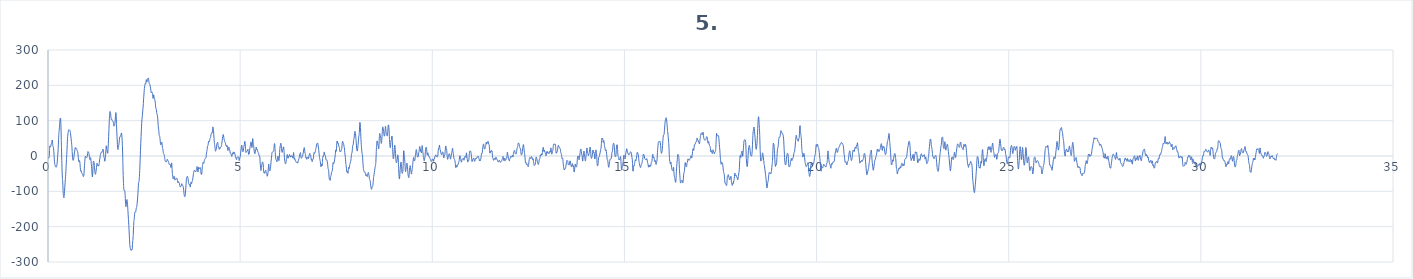
| Category | 5. kanál |
|---|---|
| 0.0 | -8.5 |
| 0.0078125 | -5.8 |
| 0.015625 | -3.4 |
| 0.0234375 | -5.3 |
| 0.03125 | -0.5 |
| 0.0390625 | 15.7 |
| 0.046875 | 28.1 |
| 0.0546875 | 28.7 |
| 0.0625 | 26.1 |
| 0.0703125 | 26.9 |
| 0.078125 | 31.5 |
| 0.0859375 | 34.8 |
| 0.09375 | 35.1 |
| 0.1015625 | 39.7 |
| 0.109375 | 45.2 |
| 0.1171875 | 39.4 |
| 0.125 | 29.9 |
| 0.1328125 | 26.7 |
| 0.140625 | 23.4 |
| 0.1484375 | 16.4 |
| 0.15625 | 5.7 |
| 0.1640625 | -9 |
| 0.171875 | -19.6 |
| 0.1796875 | -23.7 |
| 0.1875 | -27.8 |
| 0.1953125 | -30.5 |
| 0.203125 | -30.4 |
| 0.2109375 | -31.5 |
| 0.21875 | -31.2 |
| 0.2265625 | -27.9 |
| 0.234375 | -23.1 |
| 0.2421875 | -14.2 |
| 0.25 | -2.1 |
| 0.2578125 | 8.3 |
| 0.265625 | 21.5 |
| 0.2734375 | 42.2 |
| 0.28125 | 61.2 |
| 0.2890625 | 71.3 |
| 0.296875 | 79.9 |
| 0.3046875 | 92.3 |
| 0.3125 | 102.2 |
| 0.3203125 | 107.2 |
| 0.328125 | 106.1 |
| 0.3359375 | 88 |
| 0.34375 | 53.8 |
| 0.3515625 | 19.7 |
| 0.359375 | -13.3 |
| 0.3671875 | -45.1 |
| 0.375 | -62.5 |
| 0.3828125 | -73.9 |
| 0.390625 | -93.4 |
| 0.3984375 | -109 |
| 0.40625 | -115.3 |
| 0.4140625 | -118.2 |
| 0.421875 | -112.4 |
| 0.4296875 | -100 |
| 0.4375 | -87.9 |
| 0.4453125 | -74.9 |
| 0.453125 | -63.1 |
| 0.4609375 | -52 |
| 0.46875 | -35.5 |
| 0.4765625 | -17.7 |
| 0.484375 | -3.5 |
| 0.4921875 | 12.3 |
| 0.5 | 32.6 |
| 0.5078125 | 50 |
| 0.515625 | 59.3 |
| 0.5234375 | 65.8 |
| 0.53125 | 71.6 |
| 0.5390625 | 74.2 |
| 0.546875 | 74.5 |
| 0.5546875 | 73.3 |
| 0.5625 | 72.4 |
| 0.5703125 | 72.9 |
| 0.578125 | 69.6 |
| 0.5859375 | 62.8 |
| 0.59375 | 56.4 |
| 0.6015625 | 48.7 |
| 0.609375 | 40.9 |
| 0.6171875 | 33 |
| 0.625 | 20.3 |
| 0.6328125 | 5.9 |
| 0.640625 | -5 |
| 0.6484375 | -11.2 |
| 0.65625 | -12.4 |
| 0.6640625 | -10.1 |
| 0.671875 | -5 |
| 0.6796875 | 2.7 |
| 0.6875 | 8.5 |
| 0.6953125 | 13.8 |
| 0.703125 | 21.3 |
| 0.7109375 | 23.9 |
| 0.71875 | 21.2 |
| 0.7265625 | 21.3 |
| 0.734375 | 22.3 |
| 0.7421875 | 20.7 |
| 0.75 | 18.5 |
| 0.7578125 | 15.5 |
| 0.765625 | 13.5 |
| 0.7734375 | 10.9 |
| 0.78125 | 3.5 |
| 0.7890625 | -4.4 |
| 0.796875 | -11.1 |
| 0.8046875 | -16.4 |
| 0.8125 | -15.2 |
| 0.8203125 | -13 |
| 0.828125 | -17.1 |
| 0.8359375 | -26.1 |
| 0.84375 | -37.5 |
| 0.8515625 | -43 |
| 0.859375 | -41.1 |
| 0.8671875 | -43.5 |
| 0.875 | -48.4 |
| 0.8828125 | -49.3 |
| 0.890625 | -49.8 |
| 0.8984375 | -50.3 |
| 0.90625 | -52.7 |
| 0.9140625 | -57.2 |
| 0.921875 | -58.2 |
| 0.9296875 | -56.7 |
| 0.9375 | -49.9 |
| 0.9453125 | -34.7 |
| 0.953125 | -21.2 |
| 0.9609375 | -10.9 |
| 0.96875 | -1.9 |
| 0.9765625 | -0.4 |
| 0.984375 | -2.4 |
| 0.9921875 | -2.8 |
| 1.0 | -4.4 |
| 1.0078125 | -4.7 |
| 1.015625 | -3.5 |
| 1.0234375 | -1 |
| 1.03125 | 6.7 |
| 1.0390625 | 12.6 |
| 1.046875 | 10.4 |
| 1.0546875 | 9.2 |
| 1.0625 | 9.4 |
| 1.0703125 | 3.8 |
| 1.078125 | -4 |
| 1.0859375 | -9.3 |
| 1.09375 | -10 |
| 1.1015625 | -5.8 |
| 1.109375 | -4.7 |
| 1.1171875 | -11.5 |
| 1.125 | -20.3 |
| 1.1328125 | -29.6 |
| 1.140625 | -41.8 |
| 1.1484375 | -53.7 |
| 1.15625 | -59.5 |
| 1.1640625 | -51.7 |
| 1.171875 | -30.6 |
| 1.1796875 | -15.1 |
| 1.1875 | -14.6 |
| 1.1953125 | -17.3 |
| 1.203125 | -21.6 |
| 1.2109375 | -33.2 |
| 1.21875 | -44 |
| 1.2265625 | -49.3 |
| 1.234375 | -51.9 |
| 1.2421875 | -49.2 |
| 1.25 | -42.8 |
| 1.2578125 | -36.8 |
| 1.265625 | -28 |
| 1.2734375 | -20.7 |
| 1.28125 | -22.9 |
| 1.2890625 | -26.4 |
| 1.296875 | -25.1 |
| 1.3046875 | -26 |
| 1.3125 | -28.7 |
| 1.3203125 | -27.8 |
| 1.328125 | -24.2 |
| 1.3359375 | -18.3 |
| 1.34375 | -11.1 |
| 1.3515625 | -5.6 |
| 1.359375 | 0.8 |
| 1.3671875 | 7 |
| 1.375 | 8.1 |
| 1.3828125 | 7.7 |
| 1.390625 | 10.5 |
| 1.3984375 | 11.8 |
| 1.40625 | 10.7 |
| 1.4140625 | 13.3 |
| 1.421875 | 18.1 |
| 1.4296875 | 19.6 |
| 1.4375 | 17.3 |
| 1.4453125 | 9.3 |
| 1.453125 | -0.8 |
| 1.4609375 | -4.4 |
| 1.46875 | -7.6 |
| 1.4765625 | -14.4 |
| 1.484375 | -13.1 |
| 1.4921875 | -4.6 |
| 1.5 | 4.3 |
| 1.5078125 | 18.5 |
| 1.515625 | 29 |
| 1.5234375 | 25.5 |
| 1.53125 | 19.3 |
| 1.5390625 | 15.1 |
| 1.546875 | 8.5 |
| 1.5546875 | 7.9 |
| 1.5625 | 18.7 |
| 1.5703125 | 35.3 |
| 1.578125 | 54.6 |
| 1.5859375 | 75.2 |
| 1.59375 | 96.2 |
| 1.6015625 | 115.2 |
| 1.609375 | 125.1 |
| 1.6171875 | 125.5 |
| 1.625 | 123.1 |
| 1.6328125 | 116.5 |
| 1.640625 | 106.6 |
| 1.6484375 | 103.2 |
| 1.65625 | 104.5 |
| 1.6640625 | 102.4 |
| 1.671875 | 100.5 |
| 1.6796875 | 99.6 |
| 1.6875 | 97.3 |
| 1.6953125 | 97.4 |
| 1.703125 | 95.5 |
| 1.7109375 | 87.9 |
| 1.71875 | 84.4 |
| 1.7265625 | 86.5 |
| 1.734375 | 88.6 |
| 1.7421875 | 94.2 |
| 1.75 | 104.1 |
| 1.7578125 | 115.3 |
| 1.765625 | 123 |
| 1.7734375 | 115.5 |
| 1.78125 | 92.6 |
| 1.7890625 | 70.5 |
| 1.796875 | 54.5 |
| 1.8046875 | 37 |
| 1.8125 | 21.3 |
| 1.8203125 | 18.2 |
| 1.828125 | 24.4 |
| 1.8359375 | 28.7 |
| 1.84375 | 31.5 |
| 1.8515625 | 38.7 |
| 1.859375 | 47.7 |
| 1.8671875 | 53.7 |
| 1.875 | 55.3 |
| 1.8828125 | 55.3 |
| 1.890625 | 57.1 |
| 1.8984375 | 60.3 |
| 1.90625 | 64 |
| 1.9140625 | 64.8 |
| 1.921875 | 57.3 |
| 1.9296875 | 44.3 |
| 1.9375 | 25.8 |
| 1.9453125 | -5.2 |
| 1.953125 | -40.5 |
| 1.9609375 | -67.6 |
| 1.96875 | -86.8 |
| 1.9765625 | -96.7 |
| 1.984375 | -97.5 |
| 1.9921875 | -97.3 |
| 2.0 | -100.6 |
| 2.0078125 | -111.8 |
| 2.015625 | -130.2 |
| 2.0234375 | -143 |
| 2.03125 | -143.6 |
| 2.0390625 | -136.2 |
| 2.046875 | -127 |
| 2.0546875 | -123.2 |
| 2.0625 | -128.1 |
| 2.0703125 | -137.6 |
| 2.078125 | -150.8 |
| 2.0859375 | -166.5 |
| 2.09375 | -180.2 |
| 2.1015625 | -193.2 |
| 2.109375 | -209.1 |
| 2.1171875 | -226.8 |
| 2.125 | -243.4 |
| 2.1328125 | -254.8 |
| 2.140625 | -260.1 |
| 2.1484375 | -263.1 |
| 2.15625 | -265.9 |
| 2.1640625 | -267.2 |
| 2.171875 | -265.4 |
| 2.1796875 | -264.4 |
| 2.1875 | -265.5 |
| 2.1953125 | -257.8 |
| 2.203125 | -243 |
| 2.2109375 | -235.1 |
| 2.21875 | -222.8 |
| 2.2265625 | -199.4 |
| 2.234375 | -185.1 |
| 2.2421875 | -179.8 |
| 2.25 | -170 |
| 2.2578125 | -161.4 |
| 2.265625 | -158.3 |
| 2.2734375 | -158 |
| 2.28125 | -158.5 |
| 2.2890625 | -153.6 |
| 2.296875 | -147.1 |
| 2.3046875 | -145.3 |
| 2.3125 | -142 |
| 2.3203125 | -134 |
| 2.328125 | -124.5 |
| 2.3359375 | -113.1 |
| 2.34375 | -98.8 |
| 2.3515625 | -84.1 |
| 2.359375 | -75.5 |
| 2.3671875 | -72.5 |
| 2.375 | -64.4 |
| 2.3828125 | -49.5 |
| 2.390625 | -31.1 |
| 2.3984375 | -8.6 |
| 2.40625 | 15 |
| 2.4140625 | 35.6 |
| 2.421875 | 54.7 |
| 2.4296875 | 74.5 |
| 2.4375 | 92.7 |
| 2.4453125 | 103.7 |
| 2.453125 | 111.2 |
| 2.4609375 | 121.7 |
| 2.46875 | 131.3 |
| 2.4765625 | 141.5 |
| 2.484375 | 155.8 |
| 2.4921875 | 167.8 |
| 2.5 | 179 |
| 2.5078125 | 191.3 |
| 2.515625 | 197.9 |
| 2.5234375 | 201.9 |
| 2.53125 | 205.2 |
| 2.5390625 | 203.5 |
| 2.546875 | 205.4 |
| 2.5546875 | 214 |
| 2.5625 | 215.8 |
| 2.5703125 | 210.3 |
| 2.578125 | 210.2 |
| 2.5859375 | 215.7 |
| 2.59375 | 218.5 |
| 2.6015625 | 218.9 |
| 2.609375 | 220.9 |
| 2.6171875 | 219.2 |
| 2.625 | 211.2 |
| 2.6328125 | 205.6 |
| 2.640625 | 204.9 |
| 2.6484375 | 203 |
| 2.65625 | 199.1 |
| 2.6640625 | 195.2 |
| 2.671875 | 190 |
| 2.6796875 | 183.2 |
| 2.6875 | 178.7 |
| 2.6953125 | 179.5 |
| 2.703125 | 181.6 |
| 2.7109375 | 180.1 |
| 2.71875 | 176.8 |
| 2.7265625 | 169.8 |
| 2.734375 | 162.8 |
| 2.7421875 | 167.2 |
| 2.75 | 173.3 |
| 2.7578125 | 168.9 |
| 2.765625 | 164.4 |
| 2.7734375 | 162.2 |
| 2.78125 | 157.5 |
| 2.7890625 | 153.2 |
| 2.796875 | 144.7 |
| 2.8046875 | 135.6 |
| 2.8125 | 134.5 |
| 2.8203125 | 131.2 |
| 2.828125 | 123.3 |
| 2.8359375 | 118.5 |
| 2.84375 | 115.1 |
| 2.8515625 | 110.4 |
| 2.859375 | 100.2 |
| 2.8671875 | 86.5 |
| 2.875 | 79.2 |
| 2.8828125 | 72.1 |
| 2.890625 | 61.4 |
| 2.8984375 | 56.9 |
| 2.90625 | 55.7 |
| 2.9140625 | 49.6 |
| 2.921875 | 40.2 |
| 2.9296875 | 32.9 |
| 2.9375 | 31.7 |
| 2.9453125 | 33 |
| 2.953125 | 35.9 |
| 2.9609375 | 39.3 |
| 2.96875 | 34 |
| 2.9765625 | 24.8 |
| 2.984375 | 21.4 |
| 2.9921875 | 16.8 |
| 3.0 | 9.9 |
| 3.0078125 | 6.9 |
| 3.015625 | 5.7 |
| 3.0234375 | 3.4 |
| 3.03125 | -1.4 |
| 3.0390625 | -7.7 |
| 3.046875 | -11.8 |
| 3.0546875 | -14.8 |
| 3.0625 | -16.8 |
| 3.0703125 | -16 |
| 3.078125 | -16 |
| 3.0859375 | -16.2 |
| 3.09375 | -13.4 |
| 3.1015625 | -9.9 |
| 3.109375 | -9.3 |
| 3.1171875 | -12 |
| 3.125 | -14.3 |
| 3.1328125 | -15 |
| 3.140625 | -18.2 |
| 3.1484375 | -22.7 |
| 3.15625 | -24.2 |
| 3.1640625 | -23.3 |
| 3.171875 | -22.7 |
| 3.1796875 | -23.4 |
| 3.1875 | -26.5 |
| 3.1953125 | -32.1 |
| 3.203125 | -32.7 |
| 3.2109375 | -23.4 |
| 3.21875 | -19.5 |
| 3.2265625 | -31.9 |
| 3.234375 | -45.5 |
| 3.2421875 | -53.4 |
| 3.25 | -61.3 |
| 3.2578125 | -65.1 |
| 3.265625 | -63.5 |
| 3.2734375 | -60.4 |
| 3.28125 | -57.1 |
| 3.2890625 | -59.8 |
| 3.296875 | -66.7 |
| 3.3046875 | -68.4 |
| 3.3125 | -66.2 |
| 3.3203125 | -64.2 |
| 3.328125 | -63.1 |
| 3.3359375 | -63.8 |
| 3.34375 | -63.1 |
| 3.3515625 | -62.3 |
| 3.359375 | -64.8 |
| 3.3671875 | -69.4 |
| 3.375 | -74.7 |
| 3.3828125 | -75.8 |
| 3.390625 | -72.5 |
| 3.3984375 | -72.7 |
| 3.40625 | -74.9 |
| 3.4140625 | -75.8 |
| 3.421875 | -79.3 |
| 3.4296875 | -83.4 |
| 3.4375 | -86.6 |
| 3.4453125 | -87.7 |
| 3.453125 | -85.4 |
| 3.4609375 | -84.9 |
| 3.46875 | -84.2 |
| 3.4765625 | -79.1 |
| 3.484375 | -78.5 |
| 3.4921875 | -82.1 |
| 3.5 | -82.5 |
| 3.5078125 | -83.2 |
| 3.515625 | -86.1 |
| 3.5234375 | -90.3 |
| 3.53125 | -97.8 |
| 3.5390625 | -106.1 |
| 3.546875 | -111.6 |
| 3.5546875 | -114.5 |
| 3.5625 | -115.1 |
| 3.5703125 | -111.2 |
| 3.578125 | -101.9 |
| 3.5859375 | -90.2 |
| 3.59375 | -77.2 |
| 3.6015625 | -65.9 |
| 3.609375 | -61.2 |
| 3.6171875 | -59.3 |
| 3.625 | -57.3 |
| 3.6328125 | -58.6 |
| 3.640625 | -61.8 |
| 3.6484375 | -67.1 |
| 3.65625 | -74.9 |
| 3.6640625 | -79.5 |
| 3.671875 | -80.9 |
| 3.6796875 | -80.9 |
| 3.6875 | -80.1 |
| 3.6953125 | -84.4 |
| 3.703125 | -87.9 |
| 3.7109375 | -80.8 |
| 3.71875 | -74.3 |
| 3.7265625 | -77.2 |
| 3.734375 | -79 |
| 3.7421875 | -75.5 |
| 3.75 | -72.4 |
| 3.7578125 | -69.5 |
| 3.765625 | -65.3 |
| 3.7734375 | -60.3 |
| 3.78125 | -53.5 |
| 3.7890625 | -46.5 |
| 3.796875 | -42.4 |
| 3.8046875 | -40.7 |
| 3.8125 | -41.1 |
| 3.8203125 | -43.2 |
| 3.828125 | -43.6 |
| 3.8359375 | -43.8 |
| 3.84375 | -45.1 |
| 3.8515625 | -43.4 |
| 3.859375 | -39.1 |
| 3.8671875 | -35.2 |
| 3.875 | -30.9 |
| 3.8828125 | -30 |
| 3.890625 | -36.1 |
| 3.8984375 | -43.9 |
| 3.90625 | -44.7 |
| 3.9140625 | -37.3 |
| 3.921875 | -31.7 |
| 3.9296875 | -34.1 |
| 3.9375 | -36.1 |
| 3.9453125 | -35.3 |
| 3.953125 | -35.3 |
| 3.9609375 | -33.1 |
| 3.96875 | -34.3 |
| 3.9765625 | -44.1 |
| 3.984375 | -51 |
| 3.9921875 | -52 |
| 4.0 | -51.2 |
| 4.0078125 | -42.7 |
| 4.015625 | -30.5 |
| 4.0234375 | -23.6 |
| 4.03125 | -19.3 |
| 4.0390625 | -17.8 |
| 4.046875 | -20.4 |
| 4.0546875 | -20.7 |
| 4.0625 | -16.3 |
| 4.0703125 | -11.6 |
| 4.078125 | -9.8 |
| 4.0859375 | -8.8 |
| 4.09375 | -6.6 |
| 4.1015625 | -5.5 |
| 4.109375 | -5 |
| 4.1171875 | 0.6 |
| 4.125 | 8.7 |
| 4.1328125 | 13.2 |
| 4.140625 | 18.2 |
| 4.1484375 | 25.5 |
| 4.15625 | 28.6 |
| 4.1640625 | 30.3 |
| 4.171875 | 36.6 |
| 4.1796875 | 41.7 |
| 4.1875 | 41.2 |
| 4.1953125 | 39.9 |
| 4.203125 | 41.9 |
| 4.2109375 | 47.2 |
| 4.21875 | 50.4 |
| 4.2265625 | 51.1 |
| 4.234375 | 55.1 |
| 4.2421875 | 60 |
| 4.25 | 62.8 |
| 4.2578125 | 65.5 |
| 4.265625 | 65.3 |
| 4.2734375 | 65.2 |
| 4.28125 | 73.4 |
| 4.2890625 | 82.4 |
| 4.296875 | 80.8 |
| 4.3046875 | 72.6 |
| 4.3125 | 62.7 |
| 4.3203125 | 50.4 |
| 4.328125 | 39 |
| 4.3359375 | 32.4 |
| 4.34375 | 26.5 |
| 4.3515625 | 17.9 |
| 4.359375 | 13.4 |
| 4.3671875 | 15.9 |
| 4.375 | 17.9 |
| 4.3828125 | 22 |
| 4.390625 | 31.3 |
| 4.3984375 | 35.9 |
| 4.40625 | 36.5 |
| 4.4140625 | 39.3 |
| 4.421875 | 34.8 |
| 4.4296875 | 26.6 |
| 4.4375 | 27 |
| 4.4453125 | 25.3 |
| 4.453125 | 19.1 |
| 4.4609375 | 20.5 |
| 4.46875 | 23.6 |
| 4.4765625 | 21.9 |
| 4.484375 | 22 |
| 4.4921875 | 24.7 |
| 4.5 | 26.2 |
| 4.5078125 | 26.5 |
| 4.515625 | 29.2 |
| 4.5234375 | 36.4 |
| 4.53125 | 43.1 |
| 4.5390625 | 48.6 |
| 4.546875 | 55.5 |
| 4.5546875 | 60.4 |
| 4.5625 | 60.6 |
| 4.5703125 | 56.5 |
| 4.578125 | 50.1 |
| 4.5859375 | 46 |
| 4.59375 | 43.2 |
| 4.6015625 | 39.7 |
| 4.609375 | 38.8 |
| 4.6171875 | 36.3 |
| 4.625 | 30.7 |
| 4.6328125 | 29.9 |
| 4.640625 | 30.8 |
| 4.6484375 | 26.8 |
| 4.65625 | 26.3 |
| 4.6640625 | 29.1 |
| 4.671875 | 24.3 |
| 4.6796875 | 16.3 |
| 4.6875 | 16 |
| 4.6953125 | 21.5 |
| 4.703125 | 25.5 |
| 4.7109375 | 24.5 |
| 4.71875 | 20.9 |
| 4.7265625 | 18.1 |
| 4.734375 | 13.9 |
| 4.7421875 | 8.5 |
| 4.75 | 6.3 |
| 4.7578125 | 5.6 |
| 4.765625 | 4.9 |
| 4.7734375 | 2.8 |
| 4.78125 | -1.3 |
| 4.7890625 | 1.1 |
| 4.796875 | 7.1 |
| 4.8046875 | 5.2 |
| 4.8125 | 5.5 |
| 4.8203125 | 11.5 |
| 4.828125 | 9.4 |
| 4.8359375 | 6.4 |
| 4.84375 | 10.4 |
| 4.8515625 | 10.3 |
| 4.859375 | 6.9 |
| 4.8671875 | 5 |
| 4.875 | -0.4 |
| 4.8828125 | -4.5 |
| 4.890625 | -4.5 |
| 4.8984375 | -7.9 |
| 4.90625 | -10.4 |
| 4.9140625 | -6.6 |
| 4.921875 | -3.2 |
| 4.9296875 | -2.6 |
| 4.9375 | -2.5 |
| 4.9453125 | -3.2 |
| 4.953125 | -2.7 |
| 4.9609375 | -3.4 |
| 4.96875 | -9.3 |
| 4.9765625 | -13.1 |
| 4.984375 | -9.3 |
| 4.9921875 | -5.2 |
| 5.0 | -2.9 |
| 5.0078125 | 2.5 |
| 5.015625 | 11.4 |
| 5.0234375 | 19.6 |
| 5.03125 | 26.3 |
| 5.0390625 | 31 |
| 5.046875 | 28.7 |
| 5.0546875 | 19.5 |
| 5.0625 | 13.5 |
| 5.0703125 | 12.4 |
| 5.078125 | 12.2 |
| 5.0859375 | 16.4 |
| 5.09375 | 24 |
| 5.1015625 | 28.4 |
| 5.109375 | 33.1 |
| 5.1171875 | 39.9 |
| 5.125 | 41.1 |
| 5.1328125 | 33.4 |
| 5.140625 | 20.5 |
| 5.1484375 | 10.7 |
| 5.15625 | 10.4 |
| 5.1640625 | 13.1 |
| 5.171875 | 13.4 |
| 5.1796875 | 13.5 |
| 5.1875 | 14.5 |
| 5.1953125 | 17.6 |
| 5.203125 | 18.8 |
| 5.2109375 | 12.4 |
| 5.21875 | 5.6 |
| 5.2265625 | 4.5 |
| 5.234375 | 5.8 |
| 5.2421875 | 11.5 |
| 5.25 | 20.6 |
| 5.2578125 | 25 |
| 5.265625 | 28.4 |
| 5.2734375 | 35.9 |
| 5.28125 | 39.9 |
| 5.2890625 | 36.9 |
| 5.296875 | 30.5 |
| 5.3046875 | 23.6 |
| 5.3125 | 26.8 |
| 5.3203125 | 42.4 |
| 5.328125 | 49.2 |
| 5.3359375 | 41.6 |
| 5.34375 | 35.1 |
| 5.3515625 | 29.5 |
| 5.359375 | 20.5 |
| 5.3671875 | 13.8 |
| 5.375 | 9 |
| 5.3828125 | 6.2 |
| 5.390625 | 9 |
| 5.3984375 | 13.4 |
| 5.40625 | 18 |
| 5.4140625 | 24.1 |
| 5.421875 | 24.7 |
| 5.4296875 | 19.4 |
| 5.4375 | 17.9 |
| 5.4453125 | 19.4 |
| 5.453125 | 16.4 |
| 5.4609375 | 11.4 |
| 5.46875 | 9.6 |
| 5.4765625 | 9 |
| 5.484375 | 5.7 |
| 5.4921875 | 1 |
| 5.5 | 0.3 |
| 5.5078125 | -0.1 |
| 5.515625 | -8.7 |
| 5.5234375 | -22 |
| 5.53125 | -33.5 |
| 5.5390625 | -40.9 |
| 5.546875 | -39.2 |
| 5.5546875 | -32.5 |
| 5.5625 | -27.9 |
| 5.5703125 | -21.4 |
| 5.578125 | -16.7 |
| 5.5859375 | -18 |
| 5.59375 | -18.6 |
| 5.6015625 | -24.6 |
| 5.609375 | -39.9 |
| 5.6171875 | -47 |
| 5.625 | -45.3 |
| 5.6328125 | -47.8 |
| 5.640625 | -49.1 |
| 5.6484375 | -44.9 |
| 5.65625 | -41.6 |
| 5.6640625 | -40 |
| 5.671875 | -41.9 |
| 5.6796875 | -46.4 |
| 5.6875 | -47.5 |
| 5.6953125 | -50.4 |
| 5.703125 | -56.8 |
| 5.7109375 | -56.4 |
| 5.71875 | -51.2 |
| 5.7265625 | -45.7 |
| 5.734375 | -33.4 |
| 5.7421875 | -22.9 |
| 5.75 | -27.3 |
| 5.7578125 | -36.5 |
| 5.765625 | -40.1 |
| 5.7734375 | -41.8 |
| 5.78125 | -41.2 |
| 5.7890625 | -34.8 |
| 5.796875 | -25.1 |
| 5.8046875 | -16 |
| 5.8125 | -7.9 |
| 5.8203125 | 0.9 |
| 5.828125 | 8.1 |
| 5.8359375 | 10.9 |
| 5.84375 | 11.4 |
| 5.8515625 | 11.7 |
| 5.859375 | 12.3 |
| 5.8671875 | 14.3 |
| 5.875 | 18 |
| 5.8828125 | 24.8 |
| 5.890625 | 33.8 |
| 5.8984375 | 35.1 |
| 5.90625 | 24.3 |
| 5.9140625 | 9.7 |
| 5.921875 | -1.9 |
| 5.9296875 | -9.2 |
| 5.9375 | -10.8 |
| 5.9453125 | -11.9 |
| 5.953125 | -15.9 |
| 5.9609375 | -15.6 |
| 5.96875 | -9.3 |
| 5.9765625 | -3.6 |
| 5.984375 | -0.5 |
| 5.9921875 | -3.5 |
| 6.0 | -11 |
| 6.0078125 | -13.2 |
| 6.015625 | -7.8 |
| 6.0234375 | 3.3 |
| 6.03125 | 17.4 |
| 6.0390625 | 25.6 |
| 6.046875 | 30.2 |
| 6.0546875 | 35.8 |
| 6.0625 | 35 |
| 6.0703125 | 28.2 |
| 6.078125 | 20.9 |
| 6.0859375 | 13.1 |
| 6.09375 | 10.3 |
| 6.1015625 | 14.3 |
| 6.109375 | 17.6 |
| 6.1171875 | 20.3 |
| 6.125 | 25.3 |
| 6.1328125 | 25.7 |
| 6.140625 | 15.9 |
| 6.1484375 | 2.2 |
| 6.15625 | -8.6 |
| 6.1640625 | -15.9 |
| 6.171875 | -20.3 |
| 6.1796875 | -22.3 |
| 6.1875 | -21 |
| 6.1953125 | -15.4 |
| 6.203125 | -10.9 |
| 6.2109375 | -7.3 |
| 6.21875 | 0.2 |
| 6.2265625 | 4.2 |
| 6.234375 | -0.3 |
| 6.2421875 | -5.4 |
| 6.25 | -6.2 |
| 6.2578125 | -3.4 |
| 6.265625 | -0.1 |
| 6.2734375 | 1.1 |
| 6.28125 | 3.4 |
| 6.2890625 | 4.3 |
| 6.296875 | -0.6 |
| 6.3046875 | -3.3 |
| 6.3125 | -0.3 |
| 6.3203125 | -0.7 |
| 6.328125 | -2.5 |
| 6.3359375 | 0.1 |
| 6.34375 | 1.4 |
| 6.3515625 | -0.2 |
| 6.359375 | -1.5 |
| 6.3671875 | -5.2 |
| 6.375 | -6.4 |
| 6.3828125 | 2.6 |
| 6.390625 | 9.9 |
| 6.3984375 | 2.6 |
| 6.40625 | -8.1 |
| 6.4140625 | -9.3 |
| 6.421875 | -7.3 |
| 6.4296875 | -9.6 |
| 6.4375 | -13.6 |
| 6.4453125 | -16 |
| 6.453125 | -16.1 |
| 6.4609375 | -16.6 |
| 6.46875 | -17.9 |
| 6.4765625 | -16.7 |
| 6.484375 | -16.6 |
| 6.4921875 | -19.9 |
| 6.5 | -19.6 |
| 6.5078125 | -16.1 |
| 6.515625 | -12.8 |
| 6.5234375 | -9.1 |
| 6.53125 | -7.2 |
| 6.5390625 | -3.7 |
| 6.546875 | 3 |
| 6.5546875 | 5.7 |
| 6.5625 | 7.5 |
| 6.5703125 | 9.5 |
| 6.578125 | 2.9 |
| 6.5859375 | -5.4 |
| 6.59375 | -6.1 |
| 6.6015625 | -4.9 |
| 6.609375 | -4.2 |
| 6.6171875 | -2.1 |
| 6.625 | 0.4 |
| 6.6328125 | 3.8 |
| 6.640625 | 8.6 |
| 6.6484375 | 14 |
| 6.65625 | 19.2 |
| 6.6640625 | 23.2 |
| 6.671875 | 23.4 |
| 6.6796875 | 16.3 |
| 6.6875 | 8.5 |
| 6.6953125 | 6.6 |
| 6.703125 | 1.5 |
| 6.7109375 | -5.8 |
| 6.71875 | -4.8 |
| 6.7265625 | -4.9 |
| 6.734375 | -9.4 |
| 6.7421875 | -6.8 |
| 6.75 | -3.8 |
| 6.7578125 | -4.5 |
| 6.765625 | -2.6 |
| 6.7734375 | -4.3 |
| 6.78125 | -7.3 |
| 6.7890625 | -2.3 |
| 6.796875 | 2.8 |
| 6.8046875 | 5.7 |
| 6.8125 | 7.5 |
| 6.8203125 | 3.3 |
| 6.828125 | 1.1 |
| 6.8359375 | 1.9 |
| 6.84375 | -5.4 |
| 6.8515625 | -11.4 |
| 6.859375 | -9.9 |
| 6.8671875 | -12.5 |
| 6.875 | -16.1 |
| 6.8828125 | -12.7 |
| 6.890625 | -9.2 |
| 6.8984375 | -9.4 |
| 6.90625 | -6.3 |
| 6.9140625 | 3.2 |
| 6.921875 | 9.6 |
| 6.9296875 | 7.7 |
| 6.9375 | 6.7 |
| 6.9453125 | 9.3 |
| 6.953125 | 11.2 |
| 6.9609375 | 15.8 |
| 6.96875 | 21 |
| 6.9765625 | 23.4 |
| 6.984375 | 28.4 |
| 6.9921875 | 34.1 |
| 7.0 | 34.7 |
| 7.0078125 | 35.6 |
| 7.015625 | 37 |
| 7.0234375 | 33.6 |
| 7.03125 | 28.3 |
| 7.0390625 | 22.8 |
| 7.046875 | 14.8 |
| 7.0546875 | 6.2 |
| 7.0625 | -1.4 |
| 7.0703125 | -7.4 |
| 7.078125 | -11.2 |
| 7.0859375 | -16 |
| 7.09375 | -24.2 |
| 7.1015625 | -30.5 |
| 7.109375 | -28.2 |
| 7.1171875 | -22.7 |
| 7.125 | -24.8 |
| 7.1328125 | -27.9 |
| 7.140625 | -18.2 |
| 7.1484375 | -4.4 |
| 7.15625 | -0.4 |
| 7.1640625 | -1.6 |
| 7.171875 | 0.1 |
| 7.1796875 | 6.2 |
| 7.1875 | 11.5 |
| 7.1953125 | 8.2 |
| 7.203125 | 2.5 |
| 7.2109375 | 1.8 |
| 7.21875 | 0.2 |
| 7.2265625 | -5.5 |
| 7.234375 | -10.5 |
| 7.2421875 | -11.8 |
| 7.25 | -10.8 |
| 7.2578125 | -11.5 |
| 7.265625 | -14.7 |
| 7.2734375 | -19.6 |
| 7.28125 | -28 |
| 7.2890625 | -35.8 |
| 7.296875 | -38 |
| 7.3046875 | -43.5 |
| 7.3125 | -57 |
| 7.3203125 | -65.1 |
| 7.328125 | -65.1 |
| 7.3359375 | -68.2 |
| 7.34375 | -68.4 |
| 7.3515625 | -60.9 |
| 7.359375 | -56.9 |
| 7.3671875 | -54.2 |
| 7.375 | -48.1 |
| 7.3828125 | -45.6 |
| 7.390625 | -44.5 |
| 7.3984375 | -40.5 |
| 7.40625 | -32.9 |
| 7.4140625 | -22.6 |
| 7.421875 | -18.5 |
| 7.4296875 | -21.2 |
| 7.4375 | -21.4 |
| 7.4453125 | -19.3 |
| 7.453125 | -14.5 |
| 7.4609375 | -7.6 |
| 7.46875 | -3.2 |
| 7.4765625 | 5 |
| 7.484375 | 16.3 |
| 7.4921875 | 17.3 |
| 7.5 | 13.3 |
| 7.5078125 | 21.9 |
| 7.515625 | 38 |
| 7.5234375 | 42.5 |
| 7.53125 | 36.8 |
| 7.5390625 | 35.5 |
| 7.546875 | 37.4 |
| 7.5546875 | 35.4 |
| 7.5625 | 30.9 |
| 7.5703125 | 27.1 |
| 7.578125 | 25 |
| 7.5859375 | 21 |
| 7.59375 | 14.2 |
| 7.6015625 | 11.7 |
| 7.609375 | 12.5 |
| 7.6171875 | 12.1 |
| 7.625 | 14.2 |
| 7.6328125 | 17.3 |
| 7.640625 | 19.1 |
| 7.6484375 | 25.2 |
| 7.65625 | 35.7 |
| 7.6640625 | 41.5 |
| 7.671875 | 39.7 |
| 7.6796875 | 37.2 |
| 7.6875 | 36.4 |
| 7.6953125 | 32.3 |
| 7.703125 | 27.5 |
| 7.7109375 | 23.8 |
| 7.71875 | 15.2 |
| 7.7265625 | 5.5 |
| 7.734375 | -0.1 |
| 7.7421875 | -8.9 |
| 7.75 | -20.3 |
| 7.7578125 | -27.4 |
| 7.765625 | -34.8 |
| 7.7734375 | -44 |
| 7.78125 | -45.6 |
| 7.7890625 | -42.8 |
| 7.796875 | -46.1 |
| 7.8046875 | -49 |
| 7.8125 | -41.6 |
| 7.8203125 | -32.8 |
| 7.828125 | -33.2 |
| 7.8359375 | -35.5 |
| 7.84375 | -30.9 |
| 7.8515625 | -24.7 |
| 7.859375 | -21.9 |
| 7.8671875 | -19.3 |
| 7.875 | -15.8 |
| 7.8828125 | -11.1 |
| 7.890625 | -3.1 |
| 7.8984375 | 5 |
| 7.90625 | 8.1 |
| 7.9140625 | 11.4 |
| 7.921875 | 21.5 |
| 7.9296875 | 29.7 |
| 7.9375 | 30 |
| 7.9453125 | 34.5 |
| 7.953125 | 44.3 |
| 7.9609375 | 48.5 |
| 7.96875 | 53.6 |
| 7.9765625 | 64 |
| 7.984375 | 69.5 |
| 7.9921875 | 68.9 |
| 8.0 | 63.9 |
| 8.0078125 | 54.9 |
| 8.015625 | 46.1 |
| 8.0234375 | 34.8 |
| 8.03125 | 22.7 |
| 8.0390625 | 16.6 |
| 8.046875 | 13.8 |
| 8.0546875 | 16.9 |
| 8.0625 | 25.9 |
| 8.0703125 | 32.6 |
| 8.078125 | 42.8 |
| 8.0859375 | 54.6 |
| 8.09375 | 58.2 |
| 8.1015625 | 67.2 |
| 8.109375 | 86.2 |
| 8.1171875 | 95.1 |
| 8.125 | 90.2 |
| 8.1328125 | 76.6 |
| 8.140625 | 56.4 |
| 8.1484375 | 38.8 |
| 8.15625 | 26.6 |
| 8.1640625 | 15.3 |
| 8.171875 | 8 |
| 8.1796875 | 4.2 |
| 8.1875 | -4.9 |
| 8.1953125 | -19.2 |
| 8.203125 | -31.4 |
| 8.2109375 | -38.4 |
| 8.21875 | -41.8 |
| 8.2265625 | -44.2 |
| 8.234375 | -45.8 |
| 8.2421875 | -45.2 |
| 8.25 | -45.5 |
| 8.2578125 | -49.7 |
| 8.265625 | -54.5 |
| 8.2734375 | -55.8 |
| 8.28125 | -53.8 |
| 8.2890625 | -52.4 |
| 8.296875 | -55.2 |
| 8.3046875 | -58.3 |
| 8.3125 | -57.2 |
| 8.3203125 | -53.2 |
| 8.328125 | -48.4 |
| 8.3359375 | -46.5 |
| 8.34375 | -48.7 |
| 8.3515625 | -52.8 |
| 8.359375 | -59.8 |
| 8.3671875 | -66.2 |
| 8.375 | -67.2 |
| 8.3828125 | -69.6 |
| 8.390625 | -77.2 |
| 8.3984375 | -83.9 |
| 8.40625 | -89.1 |
| 8.4140625 | -94 |
| 8.421875 | -94 |
| 8.4296875 | -89.4 |
| 8.4375 | -86 |
| 8.4453125 | -85.8 |
| 8.453125 | -83.7 |
| 8.4609375 | -75.1 |
| 8.46875 | -64.7 |
| 8.4765625 | -58.1 |
| 8.484375 | -52.7 |
| 8.4921875 | -46.4 |
| 8.5 | -40.9 |
| 8.5078125 | -34.6 |
| 8.515625 | -29.1 |
| 8.5234375 | -26.5 |
| 8.53125 | -17.7 |
| 8.5390625 | 2.8 |
| 8.546875 | 23.6 |
| 8.5546875 | 35.8 |
| 8.5625 | 42.1 |
| 8.5703125 | 41.8 |
| 8.578125 | 35.9 |
| 8.5859375 | 31.4 |
| 8.59375 | 27 |
| 8.6015625 | 20 |
| 8.609375 | 22.1 |
| 8.6171875 | 39.8 |
| 8.625 | 58.3 |
| 8.6328125 | 63.7 |
| 8.640625 | 60.4 |
| 8.6484375 | 58 |
| 8.65625 | 54 |
| 8.6640625 | 43.6 |
| 8.671875 | 35.4 |
| 8.6796875 | 37.8 |
| 8.6875 | 47.3 |
| 8.6953125 | 61.5 |
| 8.703125 | 76.4 |
| 8.7109375 | 82.5 |
| 8.71875 | 79.9 |
| 8.7265625 | 75.4 |
| 8.734375 | 68.8 |
| 8.7421875 | 60.7 |
| 8.75 | 56.4 |
| 8.7578125 | 56.9 |
| 8.765625 | 62.8 |
| 8.7734375 | 75.2 |
| 8.78125 | 84 |
| 8.7890625 | 79.8 |
| 8.796875 | 69.8 |
| 8.8046875 | 64.4 |
| 8.8125 | 61.9 |
| 8.8203125 | 58.4 |
| 8.828125 | 56.4 |
| 8.8359375 | 61.3 |
| 8.84375 | 73 |
| 8.8515625 | 84 |
| 8.859375 | 88.2 |
| 8.8671875 | 84.8 |
| 8.875 | 73.3 |
| 8.8828125 | 55.5 |
| 8.890625 | 38.9 |
| 8.8984375 | 28.3 |
| 8.90625 | 23.1 |
| 8.9140625 | 27.1 |
| 8.921875 | 38.5 |
| 8.9296875 | 44.4 |
| 8.9375 | 47.1 |
| 8.9453125 | 55.3 |
| 8.953125 | 56.7 |
| 8.9609375 | 40.8 |
| 8.96875 | 18.5 |
| 8.9765625 | 1.2 |
| 8.984375 | -7.4 |
| 8.9921875 | -7.3 |
| 9.0 | -0.4 |
| 9.0078125 | 11.9 |
| 9.015625 | 24.5 |
| 9.0234375 | 30.4 |
| 9.03125 | 26.5 |
| 9.0390625 | 14.3 |
| 9.046875 | -0.2 |
| 9.0546875 | -11.6 |
| 9.0625 | -18.3 |
| 9.0703125 | -19 |
| 9.078125 | -15.7 |
| 9.0859375 | -10 |
| 9.09375 | -2.1 |
| 9.1015625 | 3.3 |
| 9.109375 | 0.3 |
| 9.1171875 | -14 |
| 9.125 | -35.5 |
| 9.1328125 | -53.8 |
| 9.140625 | -64.5 |
| 9.1484375 | -64.6 |
| 9.15625 | -52.5 |
| 9.1640625 | -38.5 |
| 9.171875 | -28.2 |
| 9.1796875 | -19.5 |
| 9.1875 | -17.2 |
| 9.1953125 | -23.4 |
| 9.203125 | -36.1 |
| 9.2109375 | -48.5 |
| 9.21875 | -49.3 |
| 9.2265625 | -45.7 |
| 9.234375 | -43.8 |
| 9.2421875 | -26.1 |
| 9.25 | 2.7 |
| 9.2578125 | 15 |
| 9.265625 | 9.1 |
| 9.2734375 | -0.4 |
| 9.28125 | -9.2 |
| 9.2890625 | -21.5 |
| 9.296875 | -37.4 |
| 9.3046875 | -44.5 |
| 9.3125 | -39.8 |
| 9.3203125 | -35.3 |
| 9.328125 | -29.2 |
| 9.3359375 | -20.7 |
| 9.34375 | -21.1 |
| 9.3515625 | -28.9 |
| 9.359375 | -38.9 |
| 9.3671875 | -50.2 |
| 9.375 | -56.7 |
| 9.3828125 | -59.6 |
| 9.390625 | -61 |
| 9.3984375 | -53.1 |
| 9.40625 | -41.1 |
| 9.4140625 | -33.4 |
| 9.421875 | -27.7 |
| 9.4296875 | -28.7 |
| 9.4375 | -36.6 |
| 9.4453125 | -43.1 |
| 9.453125 | -49.3 |
| 9.4609375 | -51.1 |
| 9.46875 | -44.3 |
| 9.4765625 | -38.4 |
| 9.484375 | -32.2 |
| 9.4921875 | -21.9 |
| 9.5 | -14.1 |
| 9.5078125 | -7.2 |
| 9.515625 | -4.2 |
| 9.5234375 | -10.3 |
| 9.53125 | -13.8 |
| 9.5390625 | -13 |
| 9.546875 | -12.1 |
| 9.5546875 | -4.1 |
| 9.5625 | 5.1 |
| 9.5703125 | 10 |
| 9.578125 | 16.2 |
| 9.5859375 | 18.2 |
| 9.59375 | 12.5 |
| 9.6015625 | 5.4 |
| 9.609375 | -0.8 |
| 9.6171875 | -3 |
| 9.625 | -3 |
| 9.6328125 | -2.6 |
| 9.640625 | 3.1 |
| 9.6484375 | 9.1 |
| 9.65625 | 13.3 |
| 9.6640625 | 21.7 |
| 9.671875 | 26.8 |
| 9.6796875 | 24.4 |
| 9.6875 | 20.2 |
| 9.6953125 | 14.2 |
| 9.703125 | 11.5 |
| 9.7109375 | 11.4 |
| 9.71875 | 8.8 |
| 9.7265625 | 16.6 |
| 9.734375 | 29.7 |
| 9.7421875 | 26.7 |
| 9.75 | 16 |
| 9.7578125 | 8.8 |
| 9.765625 | 1.1 |
| 9.7734375 | -4 |
| 9.78125 | -8.8 |
| 9.7890625 | -13.6 |
| 9.796875 | -10.6 |
| 9.8046875 | -5.4 |
| 9.8125 | 0.4 |
| 9.8203125 | 12.8 |
| 9.828125 | 22.2 |
| 9.8359375 | 24.3 |
| 9.84375 | 25 |
| 9.8515625 | 20.8 |
| 9.859375 | 10.6 |
| 9.8671875 | 3 |
| 9.875 | 4.3 |
| 9.8828125 | 9.2 |
| 9.890625 | 6.3 |
| 9.8984375 | -0.2 |
| 9.90625 | -0.5 |
| 9.9140625 | -0.4 |
| 9.921875 | -2.6 |
| 9.9296875 | -3.4 |
| 9.9375 | -6.3 |
| 9.9453125 | -9.4 |
| 9.953125 | -9.9 |
| 9.9609375 | -12.9 |
| 9.96875 | -15.4 |
| 9.9765625 | -14.7 |
| 9.984375 | -15.3 |
| 9.9921875 | -13.3 |
| 10.0 | -8.9 |
| 10.0078125 | -8.6 |
| 10.015625 | -8.4 |
| 10.0234375 | -9.3 |
| 10.03125 | -14.8 |
| 10.0390625 | -13.6 |
| 10.046875 | -7.6 |
| 10.0546875 | -7.7 |
| 10.0625 | -5.6 |
| 10.0703125 | -0.3 |
| 10.078125 | 0.1 |
| 10.0859375 | 1.5 |
| 10.09375 | 3.3 |
| 10.1015625 | 0.3 |
| 10.109375 | -1.2 |
| 10.1171875 | -1 |
| 10.125 | -2.7 |
| 10.1328125 | -2.8 |
| 10.140625 | -0.4 |
| 10.1484375 | 6.3 |
| 10.15625 | 17.3 |
| 10.1640625 | 22.3 |
| 10.171875 | 21.5 |
| 10.1796875 | 27 |
| 10.1875 | 31.2 |
| 10.1953125 | 24.1 |
| 10.203125 | 18.3 |
| 10.2109375 | 16.8 |
| 10.21875 | 10.5 |
| 10.2265625 | 6.1 |
| 10.234375 | 5.8 |
| 10.2421875 | 3.4 |
| 10.25 | 4.4 |
| 10.2578125 | 9.4 |
| 10.265625 | 11.4 |
| 10.2734375 | 11.7 |
| 10.28125 | 9.3 |
| 10.2890625 | 1.1 |
| 10.296875 | -5.2 |
| 10.3046875 | -4.4 |
| 10.3125 | -0.4 |
| 10.3203125 | 2 |
| 10.328125 | 4.4 |
| 10.3359375 | 13.4 |
| 10.34375 | 25.2 |
| 10.3515625 | 28.5 |
| 10.359375 | 24.2 |
| 10.3671875 | 20.8 |
| 10.375 | 16.3 |
| 10.3828125 | 5.8 |
| 10.390625 | -5.3 |
| 10.3984375 | -9.5 |
| 10.40625 | -7 |
| 10.4140625 | -3.5 |
| 10.421875 | -1.2 |
| 10.4296875 | 2.9 |
| 10.4375 | 6.5 |
| 10.4453125 | 6.1 |
| 10.453125 | 3.9 |
| 10.4609375 | -0.9 |
| 10.46875 | -7.8 |
| 10.4765625 | -8.7 |
| 10.484375 | -4.1 |
| 10.4921875 | 0.6 |
| 10.5 | 6.5 |
| 10.5078125 | 10.6 |
| 10.515625 | 14.7 |
| 10.5234375 | 21.4 |
| 10.53125 | 20.2 |
| 10.5390625 | 11.7 |
| 10.546875 | 6.6 |
| 10.5546875 | 0.9 |
| 10.5625 | -6.7 |
| 10.5703125 | -9.1 |
| 10.578125 | -9.3 |
| 10.5859375 | -12 |
| 10.59375 | -16.7 |
| 10.6015625 | -24.9 |
| 10.609375 | -32.6 |
| 10.6171875 | -32.1 |
| 10.625 | -26.8 |
| 10.6328125 | -27.5 |
| 10.640625 | -31.2 |
| 10.6484375 | -28.3 |
| 10.65625 | -24.7 |
| 10.6640625 | -25.4 |
| 10.671875 | -23.6 |
| 10.6796875 | -20 |
| 10.6875 | -18.1 |
| 10.6953125 | -15 |
| 10.703125 | -9.3 |
| 10.7109375 | -2.3 |
| 10.71875 | 1.1 |
| 10.7265625 | -2.8 |
| 10.734375 | -7.5 |
| 10.7421875 | -10 |
| 10.75 | -14.6 |
| 10.7578125 | -17.6 |
| 10.765625 | -14.5 |
| 10.7734375 | -9.6 |
| 10.78125 | -8.1 |
| 10.7890625 | -8.4 |
| 10.796875 | -7.3 |
| 10.8046875 | -6.3 |
| 10.8125 | -8.2 |
| 10.8203125 | -11.6 |
| 10.828125 | -11.5 |
| 10.8359375 | -6.1 |
| 10.84375 | -2.1 |
| 10.8515625 | -2.3 |
| 10.859375 | -1.4 |
| 10.8671875 | -3 |
| 10.875 | -4.3 |
| 10.8828125 | 4.3 |
| 10.890625 | 9 |
| 10.8984375 | 0.2 |
| 10.90625 | -6.8 |
| 10.9140625 | -11.6 |
| 10.921875 | -17.2 |
| 10.9296875 | -14.9 |
| 10.9375 | -11.2 |
| 10.9453125 | -12.8 |
| 10.953125 | -9.4 |
| 10.9609375 | 1.4 |
| 10.96875 | 10.9 |
| 10.9765625 | 13.8 |
| 10.984375 | 13.7 |
| 10.9921875 | 14.6 |
| 11.0 | 12.9 |
| 11.0078125 | 8.7 |
| 11.015625 | 3.2 |
| 11.0234375 | -6.3 |
| 11.03125 | -14.7 |
| 11.0390625 | -15.5 |
| 11.046875 | -11.7 |
| 11.0546875 | -8.4 |
| 11.0625 | -7.9 |
| 11.0703125 | -7.4 |
| 11.078125 | -5.5 |
| 11.0859375 | -8.4 |
| 11.09375 | -14.1 |
| 11.1015625 | -15.1 |
| 11.109375 | -13.8 |
| 11.1171875 | -11.6 |
| 11.125 | -7.2 |
| 11.1328125 | -6.2 |
| 11.140625 | -8 |
| 11.1484375 | -7.2 |
| 11.15625 | -5.3 |
| 11.1640625 | -3.1 |
| 11.171875 | -2.3 |
| 11.1796875 | -3.5 |
| 11.1875 | -1.4 |
| 11.1953125 | -0.3 |
| 11.203125 | -3.3 |
| 11.2109375 | -5.2 |
| 11.21875 | -9.4 |
| 11.2265625 | -13.8 |
| 11.234375 | -11.6 |
| 11.2421875 | -11.2 |
| 11.25 | -13.4 |
| 11.2578125 | -10.6 |
| 11.265625 | -6.3 |
| 11.2734375 | -0.3 |
| 11.28125 | 7.2 |
| 11.2890625 | 8.1 |
| 11.296875 | 7.2 |
| 11.3046875 | 14 |
| 11.3125 | 23 |
| 11.3203125 | 28.4 |
| 11.328125 | 32.5 |
| 11.3359375 | 34.2 |
| 11.34375 | 28.7 |
| 11.3515625 | 21.4 |
| 11.359375 | 19.4 |
| 11.3671875 | 20.5 |
| 11.375 | 23 |
| 11.3828125 | 26.1 |
| 11.390625 | 29.5 |
| 11.3984375 | 36.4 |
| 11.40625 | 39.3 |
| 11.4140625 | 34.3 |
| 11.421875 | 34.1 |
| 11.4296875 | 37.7 |
| 11.4375 | 38.4 |
| 11.4453125 | 40.9 |
| 11.453125 | 41.7 |
| 11.4609375 | 37.2 |
| 11.46875 | 34 |
| 11.4765625 | 32.6 |
| 11.484375 | 27.5 |
| 11.4921875 | 16.2 |
| 11.5 | 7.9 |
| 11.5078125 | 11.5 |
| 11.515625 | 14 |
| 11.5234375 | 11 |
| 11.53125 | 13.7 |
| 11.5390625 | 16.2 |
| 11.546875 | 14.5 |
| 11.5546875 | 13.8 |
| 11.5625 | 6.1 |
| 11.5703125 | -3.9 |
| 11.578125 | -5.9 |
| 11.5859375 | -8.7 |
| 11.59375 | -12.2 |
| 11.6015625 | -10.4 |
| 11.609375 | -9.1 |
| 11.6171875 | -7.6 |
| 11.625 | -6.7 |
| 11.6328125 | -10.1 |
| 11.640625 | -9.5 |
| 11.6484375 | -4.4 |
| 11.65625 | -3.1 |
| 11.6640625 | -3.9 |
| 11.671875 | -6.3 |
| 11.6796875 | -10.1 |
| 11.6875 | -10.5 |
| 11.6953125 | -10.8 |
| 11.703125 | -14.2 |
| 11.7109375 | -17.1 |
| 11.71875 | -17 |
| 11.7265625 | -14.4 |
| 11.734375 | -12.5 |
| 11.7421875 | -12.5 |
| 11.75 | -13 |
| 11.7578125 | -15.4 |
| 11.765625 | -17.9 |
| 11.7734375 | -17.7 |
| 11.78125 | -17.4 |
| 11.7890625 | -16.2 |
| 11.796875 | -14.1 |
| 11.8046875 | -14 |
| 11.8125 | -11.5 |
| 11.8203125 | -7.9 |
| 11.828125 | -6.8 |
| 11.8359375 | -2.6 |
| 11.84375 | -1.4 |
| 11.8515625 | -8.6 |
| 11.859375 | -12.5 |
| 11.8671875 | -13 |
| 11.875 | -12.8 |
| 11.8828125 | -7.1 |
| 11.890625 | -6.7 |
| 11.8984375 | -12.8 |
| 11.90625 | -12 |
| 11.9140625 | -9.7 |
| 11.921875 | -9.3 |
| 11.9296875 | -7.5 |
| 11.9375 | -5.8 |
| 11.9453125 | 2.2 |
| 11.953125 | 10.8 |
| 11.9609375 | 7.5 |
| 11.96875 | 1.9 |
| 11.9765625 | -2.8 |
| 11.984375 | -9.6 |
| 11.9921875 | -11.1 |
| 12.0 | -12.1 |
| 12.0078125 | -14.4 |
| 12.015625 | -9.5 |
| 12.0234375 | -5.9 |
| 12.03125 | -5.5 |
| 12.0390625 | -1.7 |
| 12.046875 | -1.6 |
| 12.0546875 | -3.5 |
| 12.0625 | -2.2 |
| 12.0703125 | -2.3 |
| 12.078125 | -0.6 |
| 12.0859375 | 2.3 |
| 12.09375 | -1.2 |
| 12.1015625 | -2.8 |
| 12.109375 | 4.1 |
| 12.1171875 | 10.6 |
| 12.125 | 13.1 |
| 12.1328125 | 15.2 |
| 12.140625 | 16.2 |
| 12.1484375 | 13.2 |
| 12.15625 | 8.2 |
| 12.1640625 | 6.1 |
| 12.171875 | 6.1 |
| 12.1796875 | 5.4 |
| 12.1875 | 6.7 |
| 12.1953125 | 12.6 |
| 12.203125 | 20 |
| 12.2109375 | 23.6 |
| 12.21875 | 24.8 |
| 12.2265625 | 29.3 |
| 12.234375 | 35.1 |
| 12.2421875 | 37.1 |
| 12.25 | 36.1 |
| 12.2578125 | 33.5 |
| 12.265625 | 30.3 |
| 12.2734375 | 26.6 |
| 12.28125 | 22.4 |
| 12.2890625 | 21 |
| 12.296875 | 20 |
| 12.3046875 | 12.4 |
| 12.3125 | 4.3 |
| 12.3203125 | 3 |
| 12.328125 | 4.1 |
| 12.3359375 | 6.1 |
| 12.34375 | 12.7 |
| 12.3515625 | 20.7 |
| 12.359375 | 27.2 |
| 12.3671875 | 32.1 |
| 12.375 | 31.3 |
| 12.3828125 | 24.5 |
| 12.390625 | 16.6 |
| 12.3984375 | 9.6 |
| 12.40625 | 3.6 |
| 12.4140625 | -5.5 |
| 12.421875 | -16.4 |
| 12.4296875 | -19.3 |
| 12.4375 | -18 |
| 12.4453125 | -22 |
| 12.453125 | -24.2 |
| 12.4609375 | -21.8 |
| 12.46875 | -23.5 |
| 12.4765625 | -26.6 |
| 12.484375 | -27.2 |
| 12.4921875 | -29.8 |
| 12.5 | -30 |
| 12.5078125 | -23.6 |
| 12.515625 | -16.1 |
| 12.5234375 | -9.8 |
| 12.53125 | -5.1 |
| 12.5390625 | -4.3 |
| 12.546875 | -4.8 |
| 12.5546875 | -6.3 |
| 12.5625 | -8 |
| 12.5703125 | -4.9 |
| 12.578125 | -1.3 |
| 12.5859375 | -2.1 |
| 12.59375 | -3.5 |
| 12.6015625 | -7.1 |
| 12.609375 | -10.4 |
| 12.6171875 | -7.6 |
| 12.625 | -8.2 |
| 12.6328125 | -15.7 |
| 12.640625 | -21.7 |
| 12.6484375 | -25.3 |
| 12.65625 | -27.1 |
| 12.6640625 | -26.3 |
| 12.671875 | -25.5 |
| 12.6796875 | -22.8 |
| 12.6875 | -15.4 |
| 12.6953125 | -6.7 |
| 12.703125 | -2.8 |
| 12.7109375 | -4.1 |
| 12.71875 | -6.8 |
| 12.7265625 | -11.4 |
| 12.734375 | -17.3 |
| 12.7421875 | -20.3 |
| 12.75 | -22.1 |
| 12.7578125 | -24.1 |
| 12.765625 | -22.9 |
| 12.7734375 | -18 |
| 12.78125 | -11.7 |
| 12.7890625 | -9.1 |
| 12.796875 | -9.1 |
| 12.8046875 | -3.9 |
| 12.8125 | 2.8 |
| 12.8203125 | 2.4 |
| 12.828125 | 0.8 |
| 12.8359375 | 4.6 |
| 12.84375 | 6.4 |
| 12.8515625 | 2.9 |
| 12.859375 | 3.6 |
| 12.8671875 | 10.2 |
| 12.875 | 17.4 |
| 12.8828125 | 24.1 |
| 12.890625 | 23.2 |
| 12.8984375 | 14.5 |
| 12.90625 | 13.4 |
| 12.9140625 | 17.1 |
| 12.921875 | 14.4 |
| 12.9296875 | 11.2 |
| 12.9375 | 9.4 |
| 12.9453125 | 5.2 |
| 12.953125 | 1.8 |
| 12.9609375 | 0.7 |
| 12.96875 | 5.2 |
| 12.9765625 | 12.2 |
| 12.984375 | 11.1 |
| 12.9921875 | 8.7 |
| 13.0 | 12.3 |
| 13.0078125 | 11.3 |
| 13.015625 | 7.6 |
| 13.0234375 | 8.4 |
| 13.03125 | 7.6 |
| 13.0390625 | 6.5 |
| 13.046875 | 10.7 |
| 13.0546875 | 13.2 |
| 13.0625 | 10.7 |
| 13.0703125 | 11.5 |
| 13.078125 | 18.1 |
| 13.0859375 | 23 |
| 13.09375 | 19.2 |
| 13.1015625 | 10 |
| 13.109375 | 5 |
| 13.1171875 | 7.7 |
| 13.125 | 12 |
| 13.1328125 | 14.2 |
| 13.140625 | 19 |
| 13.1484375 | 27.3 |
| 13.15625 | 32.4 |
| 13.1640625 | 33.4 |
| 13.171875 | 34.6 |
| 13.1796875 | 34.2 |
| 13.1875 | 31.9 |
| 13.1953125 | 32.6 |
| 13.203125 | 32.7 |
| 13.2109375 | 23.4 |
| 13.21875 | 10.5 |
| 13.2265625 | 7.7 |
| 13.234375 | 11.6 |
| 13.2421875 | 11.6 |
| 13.25 | 10.8 |
| 13.2578125 | 15.6 |
| 13.265625 | 22.9 |
| 13.2734375 | 28.6 |
| 13.28125 | 30.4 |
| 13.2890625 | 27.5 |
| 13.296875 | 25 |
| 13.3046875 | 25.4 |
| 13.3125 | 23.8 |
| 13.3203125 | 21.6 |
| 13.328125 | 21 |
| 13.3359375 | 16.5 |
| 13.34375 | 10 |
| 13.3515625 | 7.6 |
| 13.359375 | 4.9 |
| 13.3671875 | -1.1 |
| 13.375 | -6.9 |
| 13.3828125 | -8.1 |
| 13.390625 | -6.3 |
| 13.3984375 | -10.5 |
| 13.40625 | -21 |
| 13.4140625 | -28.9 |
| 13.421875 | -34.1 |
| 13.4296875 | -38.8 |
| 13.4375 | -39.4 |
| 13.4453125 | -36.6 |
| 13.453125 | -34.9 |
| 13.4609375 | -35.4 |
| 13.46875 | -34.1 |
| 13.4765625 | -28.8 |
| 13.484375 | -23.3 |
| 13.4921875 | -17.6 |
| 13.5 | -12.8 |
| 13.5078125 | -13.4 |
| 13.515625 | -14.3 |
| 13.5234375 | -13.7 |
| 13.53125 | -18.5 |
| 13.5390625 | -24.9 |
| 13.546875 | -25.6 |
| 13.5546875 | -24.6 |
| 13.5625 | -25 |
| 13.5703125 | -22.6 |
| 13.578125 | -16.7 |
| 13.5859375 | -13.7 |
| 13.59375 | -17 |
| 13.6015625 | -21.7 |
| 13.609375 | -25.9 |
| 13.6171875 | -30 |
| 13.625 | -30.3 |
| 13.6328125 | -27.1 |
| 13.640625 | -22.8 |
| 13.6484375 | -21.6 |
| 13.65625 | -27.5 |
| 13.6640625 | -30.5 |
| 13.671875 | -27.5 |
| 13.6796875 | -33.6 |
| 13.6875 | -44.7 |
| 13.6953125 | -44.9 |
| 13.703125 | -38.5 |
| 13.7109375 | -30.1 |
| 13.71875 | -22.7 |
| 13.7265625 | -25 |
| 13.734375 | -30.1 |
| 13.7421875 | -29.9 |
| 13.75 | -30.7 |
| 13.7578125 | -30.3 |
| 13.765625 | -22.2 |
| 13.7734375 | -10.7 |
| 13.78125 | -2.5 |
| 13.7890625 | -0.1 |
| 13.796875 | -0.2 |
| 13.8046875 | -1 |
| 13.8125 | -6.5 |
| 13.8203125 | -11 |
| 13.828125 | -7.1 |
| 13.8359375 | -0.3 |
| 13.84375 | 6.1 |
| 13.8515625 | 13.4 |
| 13.859375 | 18.5 |
| 13.8671875 | 19.9 |
| 13.875 | 15.9 |
| 13.8828125 | 8.1 |
| 13.890625 | 3.9 |
| 13.8984375 | 0.6 |
| 13.90625 | -8.8 |
| 13.9140625 | -14.5 |
| 13.921875 | -7.9 |
| 13.9296875 | 2.5 |
| 13.9375 | 9.9 |
| 13.9453125 | 14.1 |
| 13.953125 | 11.3 |
| 13.9609375 | 2.4 |
| 13.96875 | -5 |
| 13.9765625 | -10.2 |
| 13.984375 | -14.4 |
| 13.9921875 | -10.3 |
| 14.0 | 0.2 |
| 14.0078125 | 7 |
| 14.015625 | 14.6 |
| 14.0234375 | 22.7 |
| 14.03125 | 18.2 |
| 14.0390625 | 8.6 |
| 14.046875 | 6.7 |
| 14.0546875 | 4.3 |
| 14.0625 | 0.9 |
| 14.0703125 | 2.9 |
| 14.078125 | 5.9 |
| 14.0859375 | 10.4 |
| 14.09375 | 18.4 |
| 14.1015625 | 24.1 |
| 14.109375 | 24.8 |
| 14.1171875 | 19 |
| 14.125 | 6.9 |
| 14.1328125 | -3.4 |
| 14.140625 | -6.7 |
| 14.1484375 | -5.3 |
| 14.15625 | -2.8 |
| 14.1640625 | 1.1 |
| 14.171875 | 9.8 |
| 14.1796875 | 17 |
| 14.1875 | 14.1 |
| 14.1953125 | 9.2 |
| 14.203125 | 10.2 |
| 14.2109375 | 10 |
| 14.21875 | 2.5 |
| 14.2265625 | -7 |
| 14.234375 | -8.4 |
| 14.2421875 | 1.6 |
| 14.25 | 13.2 |
| 14.2578125 | 17.1 |
| 14.265625 | 16 |
| 14.2734375 | 9.9 |
| 14.28125 | -5.4 |
| 14.2890625 | -21.5 |
| 14.296875 | -27.9 |
| 14.3046875 | -27.6 |
| 14.3125 | -22.7 |
| 14.3203125 | -12.7 |
| 14.328125 | -4.6 |
| 14.3359375 | -3 |
| 14.34375 | -2.6 |
| 14.3515625 | 1 |
| 14.359375 | 5.4 |
| 14.3671875 | 9 |
| 14.375 | 14.7 |
| 14.3828125 | 19.4 |
| 14.390625 | 21.6 |
| 14.3984375 | 31.8 |
| 14.40625 | 46.8 |
| 14.4140625 | 50.4 |
| 14.421875 | 48.2 |
| 14.4296875 | 50.2 |
| 14.4375 | 47.5 |
| 14.4453125 | 39.8 |
| 14.453125 | 39.4 |
| 14.4609375 | 43.6 |
| 14.46875 | 41 |
| 14.4765625 | 32.5 |
| 14.484375 | 26.4 |
| 14.4921875 | 23.8 |
| 14.5 | 19.1 |
| 14.5078125 | 14.5 |
| 14.515625 | 15.8 |
| 14.5234375 | 17.3 |
| 14.53125 | 12.3 |
| 14.5390625 | 3.3 |
| 14.546875 | -6.1 |
| 14.5546875 | -11 |
| 14.5625 | -11.4 |
| 14.5703125 | -16.3 |
| 14.578125 | -25 |
| 14.5859375 | -30.7 |
| 14.59375 | -31.9 |
| 14.6015625 | -26.8 |
| 14.609375 | -19.7 |
| 14.6171875 | -15.2 |
| 14.625 | -10.2 |
| 14.6328125 | -8.1 |
| 14.640625 | -9.3 |
| 14.6484375 | -8 |
| 14.65625 | -7.2 |
| 14.6640625 | -3.1 |
| 14.671875 | 7.3 |
| 14.6796875 | 12 |
| 14.6875 | 12.8 |
| 14.6953125 | 21 |
| 14.703125 | 30.4 |
| 14.7109375 | 34.5 |
| 14.71875 | 36.2 |
| 14.7265625 | 34.9 |
| 14.734375 | 28.1 |
| 14.7421875 | 16 |
| 14.75 | 3.5 |
| 14.7578125 | -1.5 |
| 14.765625 | -1.2 |
| 14.7734375 | -1.7 |
| 14.78125 | 4.2 |
| 14.7890625 | 18.8 |
| 14.796875 | 28.7 |
| 14.8046875 | 31.9 |
| 14.8125 | 31.5 |
| 14.8203125 | 20.9 |
| 14.828125 | 5.4 |
| 14.8359375 | -1 |
| 14.84375 | -2.1 |
| 14.8515625 | -6.9 |
| 14.859375 | -11.2 |
| 14.8671875 | -10.3 |
| 14.875 | -8.6 |
| 14.8828125 | -8.8 |
| 14.890625 | -5.5 |
| 14.8984375 | -1.7 |
| 14.90625 | -8.4 |
| 14.9140625 | -24.1 |
| 14.921875 | -36.4 |
| 14.9296875 | -40 |
| 14.9375 | -35.5 |
| 14.9453125 | -26.5 |
| 14.953125 | -21.6 |
| 14.9609375 | -20.6 |
| 14.96875 | -14.3 |
| 14.9765625 | -3.4 |
| 14.984375 | 2.1 |
| 14.9921875 | 1.8 |
| 15.0 | 0.4 |
| 15.0078125 | -4.1 |
| 15.015625 | -8.5 |
| 15.0234375 | -3.4 |
| 15.03125 | 5.2 |
| 15.0390625 | 8.9 |
| 15.046875 | 13.9 |
| 15.0546875 | 20.2 |
| 15.0625 | 20 |
| 15.0703125 | 15.7 |
| 15.078125 | 11 |
| 15.0859375 | 7.9 |
| 15.09375 | 8.3 |
| 15.1015625 | 6.5 |
| 15.109375 | 3.1 |
| 15.1171875 | 4.3 |
| 15.125 | 5.6 |
| 15.1328125 | 5.1 |
| 15.140625 | 7 |
| 15.1484375 | 9.8 |
| 15.15625 | 11.7 |
| 15.1640625 | 12.1 |
| 15.171875 | 11 |
| 15.1796875 | 8.8 |
| 15.1875 | 3 |
| 15.1953125 | -3.9 |
| 15.203125 | -8.7 |
| 15.2109375 | -21.2 |
| 15.21875 | -39.7 |
| 15.2265625 | -43 |
| 15.234375 | -32 |
| 15.2421875 | -27.4 |
| 15.25 | -28.7 |
| 15.2578125 | -26.5 |
| 15.265625 | -22 |
| 15.2734375 | -15.3 |
| 15.28125 | -10.5 |
| 15.2890625 | -12.8 |
| 15.296875 | -13.7 |
| 15.3046875 | -9.9 |
| 15.3125 | -5.8 |
| 15.3203125 | 0.8 |
| 15.328125 | 8.2 |
| 15.3359375 | 10.6 |
| 15.34375 | 9.7 |
| 15.3515625 | 7.5 |
| 15.359375 | 3.6 |
| 15.3671875 | -3.2 |
| 15.375 | -11.7 |
| 15.3828125 | -17.7 |
| 15.390625 | -21.7 |
| 15.3984375 | -26 |
| 15.40625 | -29.6 |
| 15.4140625 | -32.2 |
| 15.421875 | -32.7 |
| 15.4296875 | -29 |
| 15.4375 | -24.4 |
| 15.4453125 | -23.5 |
| 15.453125 | -22 |
| 15.4609375 | -16 |
| 15.46875 | -12 |
| 15.4765625 | -9.3 |
| 15.484375 | -0.7 |
| 15.4921875 | 5 |
| 15.5 | 3.9 |
| 15.5078125 | 4.1 |
| 15.515625 | 0.9 |
| 15.5234375 | -6 |
| 15.53125 | -7.9 |
| 15.5390625 | -8.8 |
| 15.546875 | -10 |
| 15.5546875 | -8.7 |
| 15.5625 | -9.7 |
| 15.5703125 | -10.2 |
| 15.578125 | -7.5 |
| 15.5859375 | -8.4 |
| 15.59375 | -13.4 |
| 15.6015625 | -18.1 |
| 15.609375 | -21.1 |
| 15.6171875 | -25 |
| 15.625 | -30.8 |
| 15.6328125 | -31.2 |
| 15.640625 | -25.9 |
| 15.6484375 | -26.2 |
| 15.65625 | -29.8 |
| 15.6640625 | -27.9 |
| 15.671875 | -26.6 |
| 15.6796875 | -29.1 |
| 15.6875 | -27 |
| 15.6953125 | -20.5 |
| 15.703125 | -17.8 |
| 15.7109375 | -17.3 |
| 15.71875 | -12 |
| 15.7265625 | -2.3 |
| 15.734375 | 4.6 |
| 15.7421875 | 2.9 |
| 15.75 | -3.5 |
| 15.7578125 | -4.8 |
| 15.765625 | -3 |
| 15.7734375 | -6.2 |
| 15.78125 | -12.5 |
| 15.7890625 | -16.2 |
| 15.796875 | -15.6 |
| 15.8046875 | -12.6 |
| 15.8125 | -15.6 |
| 15.8203125 | -23.2 |
| 15.828125 | -23.1 |
| 15.8359375 | -18 |
| 15.84375 | -15.3 |
| 15.8515625 | -6.3 |
| 15.859375 | 9.1 |
| 15.8671875 | 21.1 |
| 15.875 | 30.6 |
| 15.8828125 | 38.5 |
| 15.890625 | 40.5 |
| 15.8984375 | 39.6 |
| 15.90625 | 39.4 |
| 15.9140625 | 40.4 |
| 15.921875 | 41.8 |
| 15.9296875 | 39.4 |
| 15.9375 | 34 |
| 15.9453125 | 25.6 |
| 15.953125 | 13.7 |
| 15.9609375 | 7.5 |
| 15.96875 | 9.3 |
| 15.9765625 | 10.6 |
| 15.984375 | 15.5 |
| 15.9921875 | 29.2 |
| 16.0 | 43.3 |
| 16.0078125 | 53.2 |
| 16.015625 | 58.9 |
| 16.0234375 | 59.5 |
| 16.03125 | 61.1 |
| 16.0390625 | 69.9 |
| 16.046875 | 81.9 |
| 16.0546875 | 92.1 |
| 16.0625 | 99.1 |
| 16.0703125 | 103.3 |
| 16.078125 | 106.8 |
| 16.0859375 | 108.3 |
| 16.09375 | 105.1 |
| 16.1015625 | 98.7 |
| 16.109375 | 88.8 |
| 16.1171875 | 76.9 |
| 16.125 | 68.7 |
| 16.1328125 | 61.9 |
| 16.140625 | 51.9 |
| 16.1484375 | 42.5 |
| 16.15625 | 31.3 |
| 16.1640625 | 11.6 |
| 16.171875 | -6.7 |
| 16.1796875 | -14 |
| 16.1875 | -18.7 |
| 16.1953125 | -23 |
| 16.203125 | -19.8 |
| 16.2109375 | -17.3 |
| 16.21875 | -23.9 |
| 16.2265625 | -32.5 |
| 16.234375 | -38.1 |
| 16.2421875 | -40.4 |
| 16.25 | -40.4 |
| 16.2578125 | -41.3 |
| 16.265625 | -38.7 |
| 16.2734375 | -31.8 |
| 16.28125 | -33.8 |
| 16.2890625 | -46.4 |
| 16.296875 | -56.3 |
| 16.3046875 | -60.1 |
| 16.3125 | -63.8 |
| 16.3203125 | -69.5 |
| 16.328125 | -74.4 |
| 16.3359375 | -74.3 |
| 16.34375 | -63.5 |
| 16.3515625 | -44.7 |
| 16.359375 | -29.7 |
| 16.3671875 | -20.4 |
| 16.375 | -9.9 |
| 16.3828125 | 0.5 |
| 16.390625 | 4.9 |
| 16.3984375 | 3.8 |
| 16.40625 | 1.8 |
| 16.4140625 | -2 |
| 16.421875 | -15.3 |
| 16.4296875 | -34.5 |
| 16.4375 | -48.6 |
| 16.4453125 | -60.2 |
| 16.453125 | -71.8 |
| 16.4609375 | -76.6 |
| 16.46875 | -74.8 |
| 16.4765625 | -72.2 |
| 16.484375 | -70.5 |
| 16.4921875 | -69.2 |
| 16.5 | -68.7 |
| 16.5078125 | -71.5 |
| 16.515625 | -75.6 |
| 16.5234375 | -74.7 |
| 16.53125 | -67.1 |
| 16.5390625 | -56.4 |
| 16.546875 | -48.3 |
| 16.5546875 | -45.5 |
| 16.5625 | -42 |
| 16.5703125 | -31 |
| 16.578125 | -18.9 |
| 16.5859375 | -18.7 |
| 16.59375 | -25.7 |
| 16.6015625 | -28.5 |
| 16.609375 | -30.4 |
| 16.6171875 | -30.1 |
| 16.625 | -22.7 |
| 16.6328125 | -18.6 |
| 16.640625 | -17.2 |
| 16.6484375 | -10.3 |
| 16.65625 | -8.1 |
| 16.6640625 | -11.4 |
| 16.671875 | -10.6 |
| 16.6796875 | -10.6 |
| 16.6875 | -12.4 |
| 16.6953125 | -10.2 |
| 16.703125 | -8.2 |
| 16.7109375 | -7.5 |
| 16.71875 | -4.8 |
| 16.7265625 | -1.1 |
| 16.734375 | 0.6 |
| 16.7421875 | -2.3 |
| 16.75 | -5.8 |
| 16.7578125 | -2.6 |
| 16.765625 | 5.5 |
| 16.7734375 | 12.9 |
| 16.78125 | 19.1 |
| 16.7890625 | 21 |
| 16.796875 | 17.1 |
| 16.8046875 | 16.3 |
| 16.8125 | 24.3 |
| 16.8203125 | 31.7 |
| 16.828125 | 32.2 |
| 16.8359375 | 32.2 |
| 16.84375 | 34.7 |
| 16.8515625 | 37.4 |
| 16.859375 | 40.1 |
| 16.8671875 | 41 |
| 16.875 | 40.9 |
| 16.8828125 | 46 |
| 16.890625 | 51 |
| 16.8984375 | 48 |
| 16.90625 | 45.1 |
| 16.9140625 | 45.5 |
| 16.921875 | 42.5 |
| 16.9296875 | 39.6 |
| 16.9375 | 38.7 |
| 16.9453125 | 35.3 |
| 16.953125 | 34.5 |
| 16.9609375 | 40.4 |
| 16.96875 | 48.5 |
| 16.9765625 | 54.9 |
| 16.984375 | 58.8 |
| 16.9921875 | 62.6 |
| 17.0 | 65.5 |
| 17.0078125 | 65.2 |
| 17.015625 | 63.7 |
| 17.0234375 | 61.3 |
| 17.03125 | 59.5 |
| 17.0390625 | 63.8 |
| 17.046875 | 67.6 |
| 17.0546875 | 62.1 |
| 17.0625 | 53.1 |
| 17.0703125 | 47.6 |
| 17.078125 | 46.2 |
| 17.0859375 | 46.6 |
| 17.09375 | 45.5 |
| 17.1015625 | 44.7 |
| 17.109375 | 45.7 |
| 17.1171875 | 46.1 |
| 17.125 | 48.4 |
| 17.1328125 | 53.2 |
| 17.140625 | 55 |
| 17.1484375 | 54 |
| 17.15625 | 52.7 |
| 17.1640625 | 46.8 |
| 17.171875 | 37.8 |
| 17.1796875 | 36.4 |
| 17.1875 | 40.8 |
| 17.1953125 | 39.8 |
| 17.203125 | 34.2 |
| 17.2109375 | 30.4 |
| 17.21875 | 28.6 |
| 17.2265625 | 27.6 |
| 17.234375 | 24.6 |
| 17.2421875 | 16.7 |
| 17.25 | 11.7 |
| 17.2578125 | 14.4 |
| 17.265625 | 14.9 |
| 17.2734375 | 10.4 |
| 17.28125 | 7.6 |
| 17.2890625 | 7 |
| 17.296875 | 10.9 |
| 17.3046875 | 17.3 |
| 17.3125 | 16.1 |
| 17.3203125 | 12.3 |
| 17.328125 | 11.4 |
| 17.3359375 | 7.4 |
| 17.34375 | 6.1 |
| 17.3515625 | 10.4 |
| 17.359375 | 11.9 |
| 17.3671875 | 12.8 |
| 17.375 | 18.2 |
| 17.3828125 | 32.4 |
| 17.390625 | 53.8 |
| 17.3984375 | 64 |
| 17.40625 | 59.5 |
| 17.4140625 | 57.4 |
| 17.421875 | 58.1 |
| 17.4296875 | 56.5 |
| 17.4375 | 57 |
| 17.4453125 | 57.6 |
| 17.453125 | 54.1 |
| 17.4609375 | 45 |
| 17.46875 | 32.9 |
| 17.4765625 | 23.6 |
| 17.484375 | 14.1 |
| 17.4921875 | 0.7 |
| 17.5 | -9.7 |
| 17.5078125 | -17.2 |
| 17.515625 | -23.4 |
| 17.5234375 | -22.1 |
| 17.53125 | -17.8 |
| 17.5390625 | -18.3 |
| 17.546875 | -19.2 |
| 17.5546875 | -21.1 |
| 17.5625 | -28.3 |
| 17.5703125 | -36.9 |
| 17.578125 | -43.6 |
| 17.5859375 | -47.7 |
| 17.59375 | -49.9 |
| 17.6015625 | -56.9 |
| 17.609375 | -69.3 |
| 17.6171875 | -77.1 |
| 17.625 | -77.3 |
| 17.6328125 | -77.2 |
| 17.640625 | -79.6 |
| 17.6484375 | -82.2 |
| 17.65625 | -83.9 |
| 17.6640625 | -80.1 |
| 17.671875 | -67.6 |
| 17.6796875 | -57.3 |
| 17.6875 | -56.2 |
| 17.6953125 | -55.3 |
| 17.703125 | -52.8 |
| 17.7109375 | -55.7 |
| 17.71875 | -60.3 |
| 17.7265625 | -62.9 |
| 17.734375 | -66.7 |
| 17.7421875 | -67.8 |
| 17.75 | -64.7 |
| 17.7578125 | -62.4 |
| 17.765625 | -58.5 |
| 17.7734375 | -57.3 |
| 17.78125 | -67.1 |
| 17.7890625 | -76.6 |
| 17.796875 | -79.4 |
| 17.8046875 | -83 |
| 17.8125 | -81.7 |
| 17.8203125 | -76 |
| 17.828125 | -77.7 |
| 17.8359375 | -77.2 |
| 17.84375 | -70.6 |
| 17.8515625 | -68.5 |
| 17.859375 | -63.5 |
| 17.8671875 | -52.1 |
| 17.875 | -48.1 |
| 17.8828125 | -52.2 |
| 17.890625 | -55.5 |
| 17.8984375 | -54.9 |
| 17.90625 | -53.8 |
| 17.9140625 | -57.1 |
| 17.921875 | -60.2 |
| 17.9296875 | -59.7 |
| 17.9375 | -62.6 |
| 17.9453125 | -67.1 |
| 17.953125 | -66.4 |
| 17.9609375 | -61.6 |
| 17.96875 | -54.3 |
| 17.9765625 | -48 |
| 17.984375 | -43.5 |
| 17.9921875 | -31.9 |
| 18.0 | -13 |
| 18.0078125 | 0.3 |
| 18.015625 | 1.6 |
| 18.0234375 | -3.4 |
| 18.03125 | -3.6 |
| 18.0390625 | 3.9 |
| 18.046875 | 10.3 |
| 18.0546875 | 13.1 |
| 18.0625 | 13.6 |
| 18.0703125 | 6.5 |
| 18.078125 | -1 |
| 18.0859375 | 4.2 |
| 18.09375 | 17.4 |
| 18.1015625 | 30.2 |
| 18.109375 | 40.2 |
| 18.1171875 | 44.7 |
| 18.125 | 45.8 |
| 18.1328125 | 45.6 |
| 18.140625 | 44.8 |
| 18.1484375 | 45.1 |
| 18.15625 | 38.1 |
| 18.1640625 | 16.3 |
| 18.171875 | -7.8 |
| 18.1796875 | -21.6 |
| 18.1875 | -28 |
| 18.1953125 | -29.9 |
| 18.203125 | -25 |
| 18.2109375 | -13.3 |
| 18.21875 | 1.3 |
| 18.2265625 | 14.7 |
| 18.234375 | 23.5 |
| 18.2421875 | 28.3 |
| 18.25 | 30.3 |
| 18.2578125 | 27.2 |
| 18.265625 | 20.1 |
| 18.2734375 | 12.7 |
| 18.28125 | 4.7 |
| 18.2890625 | 0.2 |
| 18.296875 | 0.6 |
| 18.3046875 | -0.2 |
| 18.3125 | 0.4 |
| 18.3203125 | 8.2 |
| 18.328125 | 22 |
| 18.3359375 | 42.1 |
| 18.34375 | 61.2 |
| 18.3515625 | 70.1 |
| 18.359375 | 75.2 |
| 18.3671875 | 81.2 |
| 18.375 | 81.3 |
| 18.3828125 | 73.4 |
| 18.390625 | 62.9 |
| 18.3984375 | 53 |
| 18.40625 | 42 |
| 18.4140625 | 30.2 |
| 18.421875 | 22 |
| 18.4296875 | 18.7 |
| 18.4375 | 21.8 |
| 18.4453125 | 31.1 |
| 18.453125 | 42.5 |
| 18.4609375 | 57.8 |
| 18.46875 | 77.8 |
| 18.4765625 | 95.4 |
| 18.484375 | 107.4 |
| 18.4921875 | 111.3 |
| 18.5 | 102.7 |
| 18.5078125 | 88.8 |
| 18.515625 | 72.8 |
| 18.5234375 | 48.2 |
| 18.53125 | 18.6 |
| 18.5390625 | -3.9 |
| 18.546875 | -13.9 |
| 18.5546875 | -14.4 |
| 18.5625 | -13.4 |
| 18.5703125 | -12.4 |
| 18.578125 | -6 |
| 18.5859375 | 3.7 |
| 18.59375 | 8.8 |
| 18.6015625 | 6.3 |
| 18.609375 | 0.3 |
| 18.6171875 | -5.5 |
| 18.625 | -12.7 |
| 18.6328125 | -20.9 |
| 18.640625 | -26.8 |
| 18.6484375 | -31.2 |
| 18.65625 | -37.6 |
| 18.6640625 | -45.4 |
| 18.671875 | -52.2 |
| 18.6796875 | -58.8 |
| 18.6875 | -67.5 |
| 18.6953125 | -78.2 |
| 18.703125 | -87.4 |
| 18.7109375 | -90.6 |
| 18.71875 | -85.7 |
| 18.7265625 | -77.2 |
| 18.734375 | -72.9 |
| 18.7421875 | -70.1 |
| 18.75 | -61.3 |
| 18.7578125 | -51.5 |
| 18.765625 | -47.2 |
| 18.7734375 | -45.8 |
| 18.78125 | -47.2 |
| 18.7890625 | -49.9 |
| 18.796875 | -48.7 |
| 18.8046875 | -48.1 |
| 18.8125 | -50.2 |
| 18.8203125 | -47.4 |
| 18.828125 | -40.3 |
| 18.8359375 | -32.4 |
| 18.84375 | -24.1 |
| 18.8515625 | -16.1 |
| 18.859375 | 1.1 |
| 18.8671875 | 25.6 |
| 18.875 | 36.4 |
| 18.8828125 | 33.9 |
| 18.890625 | 31.6 |
| 18.8984375 | 23.6 |
| 18.90625 | 7.5 |
| 18.9140625 | -9 |
| 18.921875 | -23.5 |
| 18.9296875 | -29.6 |
| 18.9375 | -25.6 |
| 18.9453125 | -23 |
| 18.953125 | -24.4 |
| 18.9609375 | -19.2 |
| 18.96875 | -4.1 |
| 18.9765625 | 11.4 |
| 18.984375 | 19.7 |
| 18.9921875 | 23.2 |
| 19.0 | 27.7 |
| 19.0078125 | 36.4 |
| 19.015625 | 46.5 |
| 19.0234375 | 52.2 |
| 19.03125 | 53.2 |
| 19.0390625 | 52.8 |
| 19.046875 | 53.5 |
| 19.0546875 | 59 |
| 19.0625 | 67 |
| 19.0703125 | 71.5 |
| 19.078125 | 71.4 |
| 19.0859375 | 67.8 |
| 19.09375 | 64.5 |
| 19.1015625 | 64.7 |
| 19.109375 | 65 |
| 19.1171875 | 63.3 |
| 19.125 | 60.6 |
| 19.1328125 | 57 |
| 19.140625 | 50.4 |
| 19.1484375 | 36.8 |
| 19.15625 | 19.1 |
| 19.1640625 | 3.4 |
| 19.171875 | -11.5 |
| 19.1796875 | -21.6 |
| 19.1875 | -23.9 |
| 19.1953125 | -25.4 |
| 19.203125 | -23.7 |
| 19.2109375 | -14.3 |
| 19.21875 | -5.9 |
| 19.2265625 | 0.2 |
| 19.234375 | 6.6 |
| 19.2421875 | 8 |
| 19.25 | 6.1 |
| 19.2578125 | 3.7 |
| 19.265625 | -6.5 |
| 19.2734375 | -22.1 |
| 19.28125 | -30.5 |
| 19.2890625 | -30.7 |
| 19.296875 | -30 |
| 19.3046875 | -29.6 |
| 19.3125 | -25.3 |
| 19.3203125 | -18.5 |
| 19.328125 | -14.1 |
| 19.3359375 | -9.8 |
| 19.34375 | -6.5 |
| 19.3515625 | -10 |
| 19.359375 | -12.9 |
| 19.3671875 | -8.9 |
| 19.375 | -6.6 |
| 19.3828125 | -7.4 |
| 19.390625 | -5 |
| 19.3984375 | -0.3 |
| 19.40625 | 5.6 |
| 19.4140625 | 9.7 |
| 19.421875 | 10.5 |
| 19.4296875 | 14 |
| 19.4375 | 21.8 |
| 19.4453125 | 31.1 |
| 19.453125 | 41.7 |
| 19.4609375 | 51.5 |
| 19.46875 | 58.2 |
| 19.4765625 | 57.8 |
| 19.484375 | 51.4 |
| 19.4921875 | 47.6 |
| 19.5 | 47.2 |
| 19.5078125 | 45.3 |
| 19.515625 | 42.7 |
| 19.5234375 | 41.8 |
| 19.53125 | 44.9 |
| 19.5390625 | 48.9 |
| 19.546875 | 51.5 |
| 19.5546875 | 64.4 |
| 19.5625 | 83.2 |
| 19.5703125 | 86 |
| 19.578125 | 74.6 |
| 19.5859375 | 64.1 |
| 19.59375 | 58.8 |
| 19.6015625 | 51.8 |
| 19.609375 | 35.3 |
| 19.6171875 | 18.3 |
| 19.625 | 10.8 |
| 19.6328125 | 4.1 |
| 19.640625 | -2.3 |
| 19.6484375 | -2.7 |
| 19.65625 | 0.3 |
| 19.6640625 | 5 |
| 19.671875 | 7.3 |
| 19.6796875 | 2.8 |
| 19.6875 | -3.9 |
| 19.6953125 | -11.3 |
| 19.703125 | -18.9 |
| 19.7109375 | -23.1 |
| 19.71875 | -26.7 |
| 19.7265625 | -30 |
| 19.734375 | -29.9 |
| 19.7421875 | -28.7 |
| 19.75 | -26.9 |
| 19.7578125 | -24.1 |
| 19.765625 | -21.8 |
| 19.7734375 | -19 |
| 19.78125 | -20.9 |
| 19.7890625 | -31.8 |
| 19.796875 | -42.5 |
| 19.8046875 | -49.3 |
| 19.8125 | -55.9 |
| 19.8203125 | -57.9 |
| 19.828125 | -54.7 |
| 19.8359375 | -50.6 |
| 19.84375 | -41.7 |
| 19.8515625 | -27.7 |
| 19.859375 | -21.2 |
| 19.8671875 | -24.8 |
| 19.875 | -24.6 |
| 19.8828125 | -20 |
| 19.890625 | -21.8 |
| 19.8984375 | -25.1 |
| 19.90625 | -22.3 |
| 19.9140625 | -20.3 |
| 19.921875 | -21.6 |
| 19.9296875 | -18.8 |
| 19.9375 | -11.5 |
| 19.9453125 | -5.2 |
| 19.953125 | -1.1 |
| 19.9609375 | 2.9 |
| 19.96875 | 7.3 |
| 19.9765625 | 15.2 |
| 19.984375 | 27.3 |
| 19.9921875 | 32.2 |
| 20.0 | 27.9 |
| 20.0078125 | 27.8 |
| 20.015625 | 32.7 |
| 20.0234375 | 33.8 |
| 20.03125 | 30.7 |
| 20.0390625 | 26 |
| 20.046875 | 22.4 |
| 20.0546875 | 21.2 |
| 20.0625 | 17.4 |
| 20.0703125 | 9.4 |
| 20.078125 | 1.1 |
| 20.0859375 | -6.9 |
| 20.09375 | -15.8 |
| 20.1015625 | -26.9 |
| 20.109375 | -39 |
| 20.1171875 | -43.2 |
| 20.125 | -38.1 |
| 20.1328125 | -33.4 |
| 20.140625 | -32.2 |
| 20.1484375 | -32.8 |
| 20.15625 | -33.9 |
| 20.1640625 | -32 |
| 20.171875 | -27.9 |
| 20.1796875 | -25 |
| 20.1875 | -23.3 |
| 20.1953125 | -24.8 |
| 20.203125 | -27.3 |
| 20.2109375 | -27.1 |
| 20.21875 | -27.9 |
| 20.2265625 | -30.3 |
| 20.234375 | -30.7 |
| 20.2421875 | -30.9 |
| 20.25 | -29.2 |
| 20.2578125 | -23.5 |
| 20.265625 | -20.6 |
| 20.2734375 | -19.5 |
| 20.28125 | -9.5 |
| 20.2890625 | 6.8 |
| 20.296875 | 14.4 |
| 20.3046875 | 8.9 |
| 20.3125 | -1.1 |
| 20.3203125 | -10.4 |
| 20.328125 | -17.7 |
| 20.3359375 | -21.1 |
| 20.34375 | -23.5 |
| 20.3515625 | -25.8 |
| 20.359375 | -28.1 |
| 20.3671875 | -33.2 |
| 20.375 | -34.1 |
| 20.3828125 | -25.7 |
| 20.390625 | -21.4 |
| 20.3984375 | -24.1 |
| 20.40625 | -23.3 |
| 20.4140625 | -19.9 |
| 20.421875 | -17.7 |
| 20.4296875 | -16.8 |
| 20.4375 | -18 |
| 20.4453125 | -17.3 |
| 20.453125 | -15.3 |
| 20.4609375 | -14.1 |
| 20.46875 | -7.3 |
| 20.4765625 | 2.7 |
| 20.484375 | 7.9 |
| 20.4921875 | 11.6 |
| 20.5 | 16 |
| 20.5078125 | 19.9 |
| 20.515625 | 22.4 |
| 20.5234375 | 19 |
| 20.53125 | 12.1 |
| 20.5390625 | 10 |
| 20.546875 | 11.3 |
| 20.5546875 | 14.2 |
| 20.5625 | 19.1 |
| 20.5703125 | 21.8 |
| 20.578125 | 23.1 |
| 20.5859375 | 25.4 |
| 20.59375 | 26.6 |
| 20.6015625 | 28.8 |
| 20.609375 | 32.6 |
| 20.6171875 | 33.5 |
| 20.625 | 33.5 |
| 20.6328125 | 35.3 |
| 20.640625 | 37.6 |
| 20.6484375 | 38.8 |
| 20.65625 | 37.3 |
| 20.6640625 | 35.2 |
| 20.671875 | 35.2 |
| 20.6796875 | 34.4 |
| 20.6875 | 31.4 |
| 20.6953125 | 28.2 |
| 20.703125 | 21.8 |
| 20.7109375 | 11.5 |
| 20.71875 | 3.5 |
| 20.7265625 | -2.7 |
| 20.734375 | -11.2 |
| 20.7421875 | -17.4 |
| 20.75 | -17.5 |
| 20.7578125 | -15.9 |
| 20.765625 | -17 |
| 20.7734375 | -20.2 |
| 20.78125 | -23.8 |
| 20.7890625 | -25.4 |
| 20.796875 | -23 |
| 20.8046875 | -17.9 |
| 20.8125 | -14.7 |
| 20.8203125 | -13.8 |
| 20.828125 | -10.3 |
| 20.8359375 | -2.2 |
| 20.84375 | 5.4 |
| 20.8515625 | 10.5 |
| 20.859375 | 14.6 |
| 20.8671875 | 13.7 |
| 20.875 | 6.4 |
| 20.8828125 | 0.1 |
| 20.890625 | -4.3 |
| 20.8984375 | -10 |
| 20.90625 | -13 |
| 20.9140625 | -11.4 |
| 20.921875 | -7.8 |
| 20.9296875 | -1.1 |
| 20.9375 | 9 |
| 20.9453125 | 15.6 |
| 20.953125 | 14.9 |
| 20.9609375 | 14.7 |
| 20.96875 | 16.1 |
| 20.9765625 | 12.7 |
| 20.984375 | 13.5 |
| 20.9921875 | 21.4 |
| 21.0 | 24.5 |
| 21.0078125 | 24.6 |
| 21.015625 | 24.5 |
| 21.0234375 | 21.1 |
| 21.03125 | 23.8 |
| 21.0390625 | 30.3 |
| 21.046875 | 29.2 |
| 21.0546875 | 31.2 |
| 21.0625 | 37.6 |
| 21.0703125 | 34.1 |
| 21.078125 | 24.2 |
| 21.0859375 | 16 |
| 21.09375 | 10.5 |
| 21.1015625 | 6.9 |
| 21.109375 | -0.5 |
| 21.1171875 | -11.8 |
| 21.125 | -19.3 |
| 21.1328125 | -20 |
| 21.140625 | -16.1 |
| 21.1484375 | -14.5 |
| 21.15625 | -15.8 |
| 21.1640625 | -13.8 |
| 21.171875 | -12.3 |
| 21.1796875 | -14.8 |
| 21.1875 | -15.4 |
| 21.1953125 | -13.8 |
| 21.203125 | -11.4 |
| 21.2109375 | -8.3 |
| 21.21875 | -7.8 |
| 21.2265625 | -4.4 |
| 21.234375 | 4.2 |
| 21.2421875 | 7.6 |
| 21.25 | 6.4 |
| 21.2578125 | 4.8 |
| 21.265625 | -3 |
| 21.2734375 | -14.8 |
| 21.28125 | -24.2 |
| 21.2890625 | -34.1 |
| 21.296875 | -44.7 |
| 21.3046875 | -51.9 |
| 21.3125 | -53.2 |
| 21.3203125 | -49.3 |
| 21.328125 | -45.4 |
| 21.3359375 | -42.5 |
| 21.34375 | -38.4 |
| 21.3515625 | -34.8 |
| 21.359375 | -29.5 |
| 21.3671875 | -20.9 |
| 21.375 | -15.2 |
| 21.3828125 | -10.6 |
| 21.390625 | -0.5 |
| 21.3984375 | 7 |
| 21.40625 | 8.5 |
| 21.4140625 | 13.1 |
| 21.421875 | 16.9 |
| 21.4296875 | 10.3 |
| 21.4375 | -2.4 |
| 21.4453125 | -13.8 |
| 21.453125 | -22.3 |
| 21.4609375 | -29.5 |
| 21.46875 | -37.3 |
| 21.4765625 | -40.4 |
| 21.484375 | -36.4 |
| 21.4921875 | -31.2 |
| 21.5 | -25.3 |
| 21.5078125 | -17.6 |
| 21.515625 | -12.5 |
| 21.5234375 | -10.5 |
| 21.53125 | -8.5 |
| 21.5390625 | -5.2 |
| 21.546875 | -1.4 |
| 21.5546875 | 1.6 |
| 21.5625 | 5.7 |
| 21.5703125 | 12.6 |
| 21.578125 | 18.6 |
| 21.5859375 | 18.9 |
| 21.59375 | 14.1 |
| 21.6015625 | 13.4 |
| 21.609375 | 17.6 |
| 21.6171875 | 16.4 |
| 21.625 | 12.9 |
| 21.6328125 | 14.9 |
| 21.640625 | 17.2 |
| 21.6484375 | 18.2 |
| 21.65625 | 21.1 |
| 21.6640625 | 23.9 |
| 21.671875 | 28.3 |
| 21.6796875 | 34 |
| 21.6875 | 34.6 |
| 21.6953125 | 28.4 |
| 21.703125 | 19.5 |
| 21.7109375 | 15.6 |
| 21.71875 | 21.6 |
| 21.7265625 | 27.7 |
| 21.734375 | 25.9 |
| 21.7421875 | 23.8 |
| 21.75 | 26 |
| 21.7578125 | 25.3 |
| 21.765625 | 20.2 |
| 21.7734375 | 14 |
| 21.78125 | 7.3 |
| 21.7890625 | 3.8 |
| 21.796875 | 4.7 |
| 21.8046875 | 6.5 |
| 21.8125 | 12 |
| 21.8203125 | 20.6 |
| 21.828125 | 26.5 |
| 21.8359375 | 33.3 |
| 21.84375 | 40.6 |
| 21.8515625 | 43.2 |
| 21.859375 | 46.1 |
| 21.8671875 | 51.3 |
| 21.875 | 57.4 |
| 21.8828125 | 63.9 |
| 21.890625 | 60.9 |
| 21.8984375 | 47.1 |
| 21.90625 | 35.3 |
| 21.9140625 | 26.3 |
| 21.921875 | 15.3 |
| 21.9296875 | 2.7 |
| 21.9375 | -12.4 |
| 21.9453125 | -23.6 |
| 21.953125 | -25.4 |
| 21.9609375 | -23.5 |
| 21.96875 | -18.4 |
| 21.9765625 | -11.3 |
| 21.984375 | -11.5 |
| 21.9921875 | -14.9 |
| 22.0 | -12 |
| 22.0078125 | -5.9 |
| 22.015625 | 0.3 |
| 22.0234375 | 4.9 |
| 22.03125 | 6.5 |
| 22.0390625 | 6.9 |
| 22.046875 | 3.3 |
| 22.0546875 | -3.8 |
| 22.0625 | -11.3 |
| 22.0703125 | -23.9 |
| 22.078125 | -35.1 |
| 22.0859375 | -38.3 |
| 22.09375 | -44.4 |
| 22.1015625 | -50.9 |
| 22.109375 | -46.9 |
| 22.1171875 | -43 |
| 22.125 | -42.5 |
| 22.1328125 | -37.6 |
| 22.140625 | -33.9 |
| 22.1484375 | -35.7 |
| 22.15625 | -37.3 |
| 22.1640625 | -35.4 |
| 22.171875 | -31.2 |
| 22.1796875 | -30.2 |
| 22.1875 | -33.2 |
| 22.1953125 | -32.8 |
| 22.203125 | -27.1 |
| 22.2109375 | -22.3 |
| 22.21875 | -20.6 |
| 22.2265625 | -21 |
| 22.234375 | -23.5 |
| 22.2421875 | -27.5 |
| 22.25 | -27.7 |
| 22.2578125 | -24.1 |
| 22.265625 | -24.2 |
| 22.2734375 | -27.3 |
| 22.28125 | -23.9 |
| 22.2890625 | -14.9 |
| 22.296875 | -10 |
| 22.3046875 | -8.9 |
| 22.3125 | -7.1 |
| 22.3203125 | -7 |
| 22.328125 | -7.2 |
| 22.3359375 | -4.4 |
| 22.34375 | -1.4 |
| 22.3515625 | 2.9 |
| 22.359375 | 11.7 |
| 22.3671875 | 19.7 |
| 22.375 | 24.4 |
| 22.3828125 | 28.9 |
| 22.390625 | 33.9 |
| 22.3984375 | 38.9 |
| 22.40625 | 41.8 |
| 22.4140625 | 41.1 |
| 22.421875 | 37.8 |
| 22.4296875 | 29.6 |
| 22.4375 | 15.7 |
| 22.4453125 | 2.9 |
| 22.453125 | -6.5 |
| 22.4609375 | -12.6 |
| 22.46875 | -11.1 |
| 22.4765625 | -6.8 |
| 22.484375 | -7.2 |
| 22.4921875 | -5.6 |
| 22.5 | 0.1 |
| 22.5078125 | 3.6 |
| 22.515625 | 4.5 |
| 22.5234375 | -2.4 |
| 22.53125 | -13.9 |
| 22.5390625 | -11.5 |
| 22.546875 | 0.1 |
| 22.5546875 | 3.4 |
| 22.5625 | 5 |
| 22.5703125 | 10.7 |
| 22.578125 | 11.8 |
| 22.5859375 | 9.5 |
| 22.59375 | 10.1 |
| 22.6015625 | 11.2 |
| 22.609375 | 7.2 |
| 22.6171875 | -2.9 |
| 22.625 | -14.2 |
| 22.6328125 | -19.2 |
| 22.640625 | -18.3 |
| 22.6484375 | -15.7 |
| 22.65625 | -11.7 |
| 22.6640625 | -7.9 |
| 22.671875 | -8.4 |
| 22.6796875 | -11.5 |
| 22.6875 | -12.6 |
| 22.6953125 | -10.2 |
| 22.703125 | -5.7 |
| 22.7109375 | -0.3 |
| 22.71875 | 5.1 |
| 22.7265625 | 6.2 |
| 22.734375 | 2.7 |
| 22.7421875 | 1.4 |
| 22.75 | 1.2 |
| 22.7578125 | -1.9 |
| 22.765625 | -2.3 |
| 22.7734375 | 0.7 |
| 22.78125 | 1.1 |
| 22.7890625 | 1.2 |
| 22.796875 | 3.2 |
| 22.8046875 | 3.8 |
| 22.8125 | -0.2 |
| 22.8203125 | -7.2 |
| 22.828125 | -8.6 |
| 22.8359375 | -3.4 |
| 22.84375 | -3.8 |
| 22.8515625 | -11.2 |
| 22.859375 | -17.7 |
| 22.8671875 | -21.6 |
| 22.875 | -21.1 |
| 22.8828125 | -17.8 |
| 22.890625 | -16.9 |
| 22.8984375 | -13.9 |
| 22.90625 | -6.9 |
| 22.9140625 | -1.5 |
| 22.921875 | 6.7 |
| 22.9296875 | 18.3 |
| 22.9375 | 26.7 |
| 22.9453125 | 35.5 |
| 22.953125 | 44.7 |
| 22.9609375 | 47.9 |
| 22.96875 | 47.3 |
| 22.9765625 | 42.1 |
| 22.984375 | 32.1 |
| 22.9921875 | 25.9 |
| 23.0 | 21.9 |
| 23.0078125 | 14.8 |
| 23.015625 | 7.1 |
| 23.0234375 | 0.1 |
| 23.03125 | -3.5 |
| 23.0390625 | -3.1 |
| 23.046875 | -5.1 |
| 23.0546875 | -7.6 |
| 23.0625 | -6.8 |
| 23.0703125 | -4.3 |
| 23.078125 | -0.7 |
| 23.0859375 | 0.7 |
| 23.09375 | 0.3 |
| 23.1015625 | 1.7 |
| 23.109375 | -0.6 |
| 23.1171875 | -8.9 |
| 23.125 | -18.5 |
| 23.1328125 | -28.1 |
| 23.140625 | -35.9 |
| 23.1484375 | -40.5 |
| 23.15625 | -43.1 |
| 23.1640625 | -43.5 |
| 23.171875 | -40.5 |
| 23.1796875 | -32.7 |
| 23.1875 | -23.2 |
| 23.1953125 | -15.9 |
| 23.203125 | -6.3 |
| 23.2109375 | 3.7 |
| 23.21875 | 9.3 |
| 23.2265625 | 17.2 |
| 23.234375 | 26 |
| 23.2421875 | 29.9 |
| 23.25 | 37.5 |
| 23.2578125 | 49 |
| 23.265625 | 53 |
| 23.2734375 | 53.1 |
| 23.28125 | 52.7 |
| 23.2890625 | 42.6 |
| 23.296875 | 28.5 |
| 23.3046875 | 22.9 |
| 23.3125 | 21 |
| 23.3203125 | 21.6 |
| 23.328125 | 31.5 |
| 23.3359375 | 40.4 |
| 23.34375 | 38.3 |
| 23.3515625 | 29.2 |
| 23.359375 | 18.2 |
| 23.3671875 | 16.5 |
| 23.375 | 25.1 |
| 23.3828125 | 28.4 |
| 23.390625 | 28.5 |
| 23.3984375 | 32.7 |
| 23.40625 | 32.8 |
| 23.4140625 | 28 |
| 23.421875 | 21.3 |
| 23.4296875 | 12.3 |
| 23.4375 | 5.1 |
| 23.4453125 | -1.9 |
| 23.453125 | -11.4 |
| 23.4609375 | -20.1 |
| 23.46875 | -29.9 |
| 23.4765625 | -39.8 |
| 23.484375 | -41.6 |
| 23.4921875 | -35.4 |
| 23.5 | -26.1 |
| 23.5078125 | -14.4 |
| 23.515625 | -5 |
| 23.5234375 | -2.8 |
| 23.53125 | -2.8 |
| 23.5390625 | -3.5 |
| 23.546875 | -8 |
| 23.5546875 | -10.4 |
| 23.5625 | -8.5 |
| 23.5703125 | -5.7 |
| 23.578125 | 2.2 |
| 23.5859375 | 10.6 |
| 23.59375 | 9.1 |
| 23.6015625 | 3.5 |
| 23.609375 | -1 |
| 23.6171875 | -4.4 |
| 23.625 | -0.7 |
| 23.6328125 | 7.8 |
| 23.640625 | 14 |
| 23.6484375 | 20.3 |
| 23.65625 | 27.1 |
| 23.6640625 | 31.9 |
| 23.671875 | 34.4 |
| 23.6796875 | 33 |
| 23.6875 | 29.6 |
| 23.6953125 | 27.4 |
| 23.703125 | 26.2 |
| 23.7109375 | 25 |
| 23.71875 | 24.5 |
| 23.7265625 | 27.5 |
| 23.734375 | 34.2 |
| 23.7421875 | 39.1 |
| 23.75 | 39.2 |
| 23.7578125 | 35.5 |
| 23.765625 | 29.5 |
| 23.7734375 | 25 |
| 23.78125 | 23.2 |
| 23.7890625 | 22.4 |
| 23.796875 | 22.9 |
| 23.8046875 | 21.1 |
| 23.8125 | 17.7 |
| 23.8203125 | 21.6 |
| 23.828125 | 30.4 |
| 23.8359375 | 33.2 |
| 23.84375 | 31.2 |
| 23.8515625 | 28.6 |
| 23.859375 | 26.7 |
| 23.8671875 | 29.7 |
| 23.875 | 33.2 |
| 23.8828125 | 30.6 |
| 23.890625 | 25.2 |
| 23.8984375 | 16.2 |
| 23.90625 | 4.6 |
| 23.9140625 | -3.5 |
| 23.921875 | -12.6 |
| 23.9296875 | -22.5 |
| 23.9375 | -24.8 |
| 23.9453125 | -27.8 |
| 23.953125 | -32.4 |
| 23.9609375 | -27.8 |
| 23.96875 | -23.3 |
| 23.9765625 | -25.1 |
| 23.984375 | -24.3 |
| 23.9921875 | -21 |
| 24.0 | -17.6 |
| 24.0078125 | -14.8 |
| 24.015625 | -17 |
| 24.0234375 | -20 |
| 24.03125 | -20.2 |
| 24.0390625 | -22.5 |
| 24.046875 | -30.5 |
| 24.0546875 | -45.8 |
| 24.0625 | -62.5 |
| 24.0703125 | -72.8 |
| 24.078125 | -81.4 |
| 24.0859375 | -90.4 |
| 24.09375 | -96.5 |
| 24.1015625 | -102.1 |
| 24.109375 | -103.7 |
| 24.1171875 | -96.7 |
| 24.125 | -88.1 |
| 24.1328125 | -79.8 |
| 24.140625 | -68 |
| 24.1484375 | -55.8 |
| 24.15625 | -43.8 |
| 24.1640625 | -28.7 |
| 24.171875 | -12.9 |
| 24.1796875 | -3.3 |
| 24.1875 | -1.6 |
| 24.1953125 | -2.2 |
| 24.203125 | -4.7 |
| 24.2109375 | -14 |
| 24.21875 | -24.8 |
| 24.2265625 | -31.2 |
| 24.234375 | -34 |
| 24.2421875 | -32.3 |
| 24.25 | -31.6 |
| 24.2578125 | -34.6 |
| 24.265625 | -28.4 |
| 24.2734375 | -16 |
| 24.28125 | -15.8 |
| 24.2890625 | -20.6 |
| 24.296875 | -13.4 |
| 24.3046875 | 1.9 |
| 24.3125 | 14.2 |
| 24.3203125 | 18.2 |
| 24.328125 | 10.6 |
| 24.3359375 | -4.9 |
| 24.34375 | -19.4 |
| 24.3515625 | -27.5 |
| 24.359375 | -26.4 |
| 24.3671875 | -18.4 |
| 24.375 | -11.4 |
| 24.3828125 | -8.7 |
| 24.390625 | -7.5 |
| 24.3984375 | -9.3 |
| 24.40625 | -14.5 |
| 24.4140625 | -15.6 |
| 24.421875 | -10 |
| 24.4296875 | -4.1 |
| 24.4375 | 0.7 |
| 24.4453125 | 8.4 |
| 24.453125 | 17.3 |
| 24.4609375 | 23.1 |
| 24.46875 | 26.2 |
| 24.4765625 | 25.2 |
| 24.484375 | 19.9 |
| 24.4921875 | 17.5 |
| 24.5 | 20.9 |
| 24.5078125 | 25.2 |
| 24.515625 | 26.6 |
| 24.5234375 | 22.9 |
| 24.53125 | 14.8 |
| 24.5390625 | 10.3 |
| 24.546875 | 13 |
| 24.5546875 | 18.4 |
| 24.5625 | 23.8 |
| 24.5703125 | 30.1 |
| 24.578125 | 36.2 |
| 24.5859375 | 35.3 |
| 24.59375 | 25.1 |
| 24.6015625 | 15.6 |
| 24.609375 | 12.2 |
| 24.6171875 | 7.8 |
| 24.625 | 0.2 |
| 24.6328125 | -3.9 |
| 24.640625 | -1.3 |
| 24.6484375 | 3 |
| 24.65625 | 3.3 |
| 24.6640625 | 2.7 |
| 24.671875 | 3.8 |
| 24.6796875 | -1.1 |
| 24.6875 | -9.4 |
| 24.6953125 | -7.8 |
| 24.703125 | 0.6 |
| 24.7109375 | 5.7 |
| 24.71875 | 8.4 |
| 24.7265625 | 9.6 |
| 24.734375 | 10.6 |
| 24.7421875 | 16.7 |
| 24.75 | 26.1 |
| 24.7578125 | 35 |
| 24.765625 | 44.1 |
| 24.7734375 | 47.8 |
| 24.78125 | 42.4 |
| 24.7890625 | 35 |
| 24.796875 | 27.5 |
| 24.8046875 | 19.1 |
| 24.8125 | 15.8 |
| 24.8203125 | 17.7 |
| 24.828125 | 17.4 |
| 24.8359375 | 15.3 |
| 24.84375 | 16.8 |
| 24.8515625 | 20.7 |
| 24.859375 | 23.3 |
| 24.8671875 | 24.5 |
| 24.875 | 24.1 |
| 24.8828125 | 20 |
| 24.890625 | 16.9 |
| 24.8984375 | 18.7 |
| 24.90625 | 18.3 |
| 24.9140625 | 11.3 |
| 24.921875 | 4.3 |
| 24.9296875 | 0.5 |
| 24.9375 | -5.8 |
| 24.9453125 | -15.1 |
| 24.953125 | -20.4 |
| 24.9609375 | -21.9 |
| 24.96875 | -21.9 |
| 24.9765625 | -16.5 |
| 24.984375 | -8.2 |
| 24.9921875 | -3.6 |
| 25.0 | -2.3 |
| 25.0078125 | -3.3 |
| 25.015625 | -5.3 |
| 25.0234375 | -5.6 |
| 25.03125 | -2.6 |
| 25.0390625 | 5.9 |
| 25.046875 | 16.1 |
| 25.0546875 | 22.7 |
| 25.0625 | 27.3 |
| 25.0703125 | 29.6 |
| 25.078125 | 28.8 |
| 25.0859375 | 24.7 |
| 25.09375 | 14.9 |
| 25.1015625 | 7 |
| 25.109375 | 7.4 |
| 25.1171875 | 10.2 |
| 25.125 | 16.1 |
| 25.1328125 | 24.8 |
| 25.140625 | 26.9 |
| 25.1484375 | 26.3 |
| 25.15625 | 26.7 |
| 25.1640625 | 21.1 |
| 25.171875 | 16 |
| 25.1796875 | 19.6 |
| 25.1875 | 23 |
| 25.1953125 | 22.4 |
| 25.203125 | 24.6 |
| 25.2109375 | 27.2 |
| 25.21875 | 18.7 |
| 25.2265625 | 0.4 |
| 25.234375 | -16.5 |
| 25.2421875 | -29.1 |
| 25.25 | -36.9 |
| 25.2578125 | -34.2 |
| 25.265625 | -24.4 |
| 25.2734375 | -13 |
| 25.28125 | 3.8 |
| 25.2890625 | 21.1 |
| 25.296875 | 26.3 |
| 25.3046875 | 21.5 |
| 25.3125 | 13.2 |
| 25.3203125 | 0.6 |
| 25.328125 | -10.3 |
| 25.3359375 | -10.1 |
| 25.34375 | 0.3 |
| 25.3515625 | 15.1 |
| 25.359375 | 24.2 |
| 25.3671875 | 19.7 |
| 25.375 | 6.7 |
| 25.3828125 | -6.3 |
| 25.390625 | -17.1 |
| 25.3984375 | -24.2 |
| 25.40625 | -26.2 |
| 25.4140625 | -23 |
| 25.421875 | -14.6 |
| 25.4296875 | -2 |
| 25.4375 | 13.6 |
| 25.4453125 | 24.3 |
| 25.453125 | 21.2 |
| 25.4609375 | 8.3 |
| 25.46875 | -4.9 |
| 25.4765625 | -15.1 |
| 25.484375 | -19.8 |
| 25.4921875 | -16.4 |
| 25.5 | -8.9 |
| 25.5078125 | -4.1 |
| 25.515625 | -2.5 |
| 25.5234375 | -6.2 |
| 25.53125 | -19.1 |
| 25.5390625 | -34.1 |
| 25.546875 | -41.1 |
| 25.5546875 | -40.9 |
| 25.5625 | -38.2 |
| 25.5703125 | -34.8 |
| 25.578125 | -31.2 |
| 25.5859375 | -29.7 |
| 25.59375 | -31.3 |
| 25.6015625 | -31.7 |
| 25.609375 | -33.9 |
| 25.6171875 | -43.4 |
| 25.625 | -50.9 |
| 25.6328125 | -48.4 |
| 25.640625 | -39.8 |
| 25.6484375 | -26.1 |
| 25.65625 | -12.1 |
| 25.6640625 | -5.5 |
| 25.671875 | -3.5 |
| 25.6796875 | -2.6 |
| 25.6875 | -4.7 |
| 25.6953125 | -9.6 |
| 25.703125 | -15.7 |
| 25.7109375 | -19.4 |
| 25.71875 | -17.7 |
| 25.7265625 | -14.5 |
| 25.734375 | -13.5 |
| 25.7421875 | -13.4 |
| 25.75 | -13.1 |
| 25.7578125 | -14 |
| 25.765625 | -16.3 |
| 25.7734375 | -18.7 |
| 25.78125 | -20.4 |
| 25.7890625 | -24.2 |
| 25.796875 | -28.9 |
| 25.8046875 | -30.2 |
| 25.8125 | -29.5 |
| 25.8203125 | -29.5 |
| 25.828125 | -28.4 |
| 25.8359375 | -29.8 |
| 25.84375 | -34.2 |
| 25.8515625 | -38.4 |
| 25.859375 | -45.7 |
| 25.8671875 | -50.9 |
| 25.875 | -46.1 |
| 25.8828125 | -40.6 |
| 25.890625 | -36.7 |
| 25.8984375 | -29.7 |
| 25.90625 | -26.8 |
| 25.9140625 | -25.1 |
| 25.921875 | -17.3 |
| 25.9296875 | -9 |
| 25.9375 | 1.6 |
| 25.9453125 | 14.6 |
| 25.953125 | 20.9 |
| 25.9609375 | 23.6 |
| 25.96875 | 27.1 |
| 25.9765625 | 27.4 |
| 25.984375 | 26 |
| 25.9921875 | 25.5 |
| 26.0 | 24.5 |
| 26.0078125 | 26.3 |
| 26.015625 | 30.4 |
| 26.0234375 | 26.7 |
| 26.03125 | 16 |
| 26.0390625 | 9 |
| 26.046875 | 1.8 |
| 26.0546875 | -12.2 |
| 26.0625 | -23.3 |
| 26.0703125 | -26.3 |
| 26.078125 | -26 |
| 26.0859375 | -25.4 |
| 26.09375 | -28.6 |
| 26.1015625 | -32.5 |
| 26.109375 | -31.9 |
| 26.1171875 | -34.5 |
| 26.125 | -40.4 |
| 26.1328125 | -38.6 |
| 26.140625 | -30.8 |
| 26.1484375 | -23.1 |
| 26.15625 | -16.2 |
| 26.1640625 | -10.6 |
| 26.171875 | -5.2 |
| 26.1796875 | -2.1 |
| 26.1875 | -4.6 |
| 26.1953125 | -7.7 |
| 26.203125 | -7.8 |
| 26.2109375 | -5.3 |
| 26.21875 | 1.8 |
| 26.2265625 | 10.9 |
| 26.234375 | 18 |
| 26.2421875 | 26.8 |
| 26.25 | 37.2 |
| 26.2578125 | 41.5 |
| 26.265625 | 37.1 |
| 26.2734375 | 30.2 |
| 26.28125 | 24.1 |
| 26.2890625 | 17.8 |
| 26.296875 | 17.1 |
| 26.3046875 | 24 |
| 26.3125 | 33.3 |
| 26.3203125 | 47.4 |
| 26.328125 | 65.3 |
| 26.3359375 | 74.2 |
| 26.34375 | 74.2 |
| 26.3515625 | 75.7 |
| 26.359375 | 78.5 |
| 26.3671875 | 80.5 |
| 26.375 | 79.7 |
| 26.3828125 | 73.7 |
| 26.390625 | 69.7 |
| 26.3984375 | 67.6 |
| 26.40625 | 59.6 |
| 26.4140625 | 51 |
| 26.421875 | 47 |
| 26.4296875 | 41.2 |
| 26.4375 | 30.5 |
| 26.4453125 | 17.6 |
| 26.453125 | 7.3 |
| 26.4609375 | 1.4 |
| 26.46875 | 0.1 |
| 26.4765625 | 7 |
| 26.484375 | 16.2 |
| 26.4921875 | 16.9 |
| 26.5 | 17 |
| 26.5078125 | 20 |
| 26.515625 | 16.2 |
| 26.5234375 | 12.2 |
| 26.53125 | 13.9 |
| 26.5390625 | 12.5 |
| 26.546875 | 11.3 |
| 26.5546875 | 14.8 |
| 26.5625 | 18.2 |
| 26.5703125 | 23.5 |
| 26.578125 | 28.6 |
| 26.5859375 | 26 |
| 26.59375 | 19.6 |
| 26.6015625 | 13.4 |
| 26.609375 | 7.4 |
| 26.6171875 | 4 |
| 26.625 | 1.4 |
| 26.6328125 | 2.1 |
| 26.640625 | 12 |
| 26.6484375 | 24 |
| 26.65625 | 32.7 |
| 26.6640625 | 38.5 |
| 26.671875 | 36.1 |
| 26.6796875 | 28.6 |
| 26.6875 | 22.1 |
| 26.6953125 | 8.7 |
| 26.703125 | -8.6 |
| 26.7109375 | -15 |
| 26.71875 | -13 |
| 26.7265625 | -11.3 |
| 26.734375 | -8.9 |
| 26.7421875 | -6.6 |
| 26.75 | -4.8 |
| 26.7578125 | -4.3 |
| 26.765625 | -10 |
| 26.7734375 | -18.1 |
| 26.78125 | -22.2 |
| 26.7890625 | -27.2 |
| 26.796875 | -32.3 |
| 26.8046875 | -30.6 |
| 26.8125 | -29.3 |
| 26.8203125 | -32.2 |
| 26.828125 | -31.5 |
| 26.8359375 | -30.8 |
| 26.84375 | -33 |
| 26.8515625 | -32.3 |
| 26.859375 | -35.9 |
| 26.8671875 | -45.6 |
| 26.875 | -49.3 |
| 26.8828125 | -49.3 |
| 26.890625 | -51.9 |
| 26.8984375 | -53.8 |
| 26.90625 | -55.8 |
| 26.9140625 | -54.9 |
| 26.921875 | -50 |
| 26.9296875 | -48.8 |
| 26.9375 | -49.7 |
| 26.9453125 | -48.4 |
| 26.953125 | -49 |
| 26.9609375 | -49.6 |
| 26.96875 | -47.2 |
| 26.9765625 | -42.8 |
| 26.984375 | -34.9 |
| 26.9921875 | -26.6 |
| 27.0 | -22.3 |
| 27.0078125 | -18.3 |
| 27.015625 | -13.6 |
| 27.0234375 | -14.1 |
| 27.03125 | -19.9 |
| 27.0390625 | -21.7 |
| 27.046875 | -17.2 |
| 27.0546875 | -13.1 |
| 27.0625 | -6.2 |
| 27.0703125 | 3.6 |
| 27.078125 | 4.3 |
| 27.0859375 | 2.2 |
| 27.09375 | 5.7 |
| 27.1015625 | 3.6 |
| 27.109375 | -1.1 |
| 27.1171875 | 1.9 |
| 27.125 | 3.1 |
| 27.1328125 | 0.7 |
| 27.140625 | 1.7 |
| 27.1484375 | 4 |
| 27.15625 | 8.1 |
| 27.1640625 | 15.5 |
| 27.171875 | 21.3 |
| 27.1796875 | 25.1 |
| 27.1875 | 30.2 |
| 27.1953125 | 35.8 |
| 27.203125 | 39.9 |
| 27.2109375 | 44.4 |
| 27.21875 | 50.2 |
| 27.2265625 | 52 |
| 27.234375 | 48.5 |
| 27.2421875 | 47.5 |
| 27.25 | 49.6 |
| 27.2578125 | 50.1 |
| 27.265625 | 49.4 |
| 27.2734375 | 49.5 |
| 27.28125 | 49.7 |
| 27.2890625 | 49.9 |
| 27.296875 | 50.2 |
| 27.3046875 | 49.3 |
| 27.3125 | 46.3 |
| 27.3203125 | 42.8 |
| 27.328125 | 40.5 |
| 27.3359375 | 39.4 |
| 27.34375 | 39 |
| 27.3515625 | 37.4 |
| 27.359375 | 33.6 |
| 27.3671875 | 30.1 |
| 27.375 | 29.8 |
| 27.3828125 | 32.6 |
| 27.390625 | 33.7 |
| 27.3984375 | 31.4 |
| 27.40625 | 30 |
| 27.4140625 | 28.2 |
| 27.421875 | 24.3 |
| 27.4296875 | 22.1 |
| 27.4375 | 19.3 |
| 27.4453125 | 14.3 |
| 27.453125 | 11.7 |
| 27.4609375 | 5.5 |
| 27.46875 | -3.4 |
| 27.4765625 | -3.3 |
| 27.484375 | -2.4 |
| 27.4921875 | -6.2 |
| 27.5 | -1.2 |
| 27.5078125 | 6.8 |
| 27.515625 | 3.7 |
| 27.5234375 | -3.9 |
| 27.53125 | -6.8 |
| 27.5390625 | -4.9 |
| 27.546875 | -3.2 |
| 27.5546875 | -6.8 |
| 27.5625 | -9 |
| 27.5703125 | -4.1 |
| 27.578125 | -0.2 |
| 27.5859375 | -2.2 |
| 27.59375 | -8 |
| 27.6015625 | -13.7 |
| 27.609375 | -16.9 |
| 27.6171875 | -22.3 |
| 27.625 | -30.1 |
| 27.6328125 | -32.2 |
| 27.640625 | -31.5 |
| 27.6484375 | -34.5 |
| 27.65625 | -33.8 |
| 27.6640625 | -27.1 |
| 27.671875 | -21.3 |
| 27.6796875 | -15.3 |
| 27.6875 | -7.3 |
| 27.6953125 | -2.6 |
| 27.703125 | 0.3 |
| 27.7109375 | 4.2 |
| 27.71875 | 5.2 |
| 27.7265625 | 4.1 |
| 27.734375 | 3.8 |
| 27.7421875 | 1.6 |
| 27.75 | -0.7 |
| 27.7578125 | -1.5 |
| 27.765625 | -4.3 |
| 27.7734375 | -8.1 |
| 27.78125 | -9.5 |
| 27.7890625 | -4.8 |
| 27.796875 | 6 |
| 27.8046875 | 9.7 |
| 27.8125 | 1 |
| 27.8203125 | -5.2 |
| 27.828125 | -4.6 |
| 27.8359375 | -5.8 |
| 27.84375 | -8 |
| 27.8515625 | -9.5 |
| 27.859375 | -11.3 |
| 27.8671875 | -11.4 |
| 27.875 | -11.6 |
| 27.8828125 | -10.5 |
| 27.890625 | -6.2 |
| 27.8984375 | -7.6 |
| 27.90625 | -14.9 |
| 27.9140625 | -19 |
| 27.921875 | -20.9 |
| 27.9296875 | -21.9 |
| 27.9375 | -21 |
| 27.9453125 | -23.3 |
| 27.953125 | -27.6 |
| 27.9609375 | -29.4 |
| 27.96875 | -29.5 |
| 27.9765625 | -28.7 |
| 27.984375 | -26.6 |
| 27.9921875 | -22.3 |
| 28.0 | -17.3 |
| 28.0078125 | -14.6 |
| 28.015625 | -10.8 |
| 28.0234375 | -6.3 |
| 28.03125 | -5.3 |
| 28.0390625 | -6.5 |
| 28.046875 | -9.8 |
| 28.0546875 | -11.5 |
| 28.0625 | -8.5 |
| 28.0703125 | -10.2 |
| 28.078125 | -15.2 |
| 28.0859375 | -11.5 |
| 28.09375 | -7.2 |
| 28.1015625 | -10.5 |
| 28.109375 | -12.4 |
| 28.1171875 | -12 |
| 28.125 | -14.7 |
| 28.1328125 | -16.4 |
| 28.140625 | -14.6 |
| 28.1484375 | -13 |
| 28.15625 | -11.7 |
| 28.1640625 | -9.1 |
| 28.171875 | -10 |
| 28.1796875 | -15.9 |
| 28.1875 | -17.2 |
| 28.1953125 | -12.1 |
| 28.203125 | -12.5 |
| 28.2109375 | -20.5 |
| 28.21875 | -23.1 |
| 28.2265625 | -15.8 |
| 28.234375 | -8.6 |
| 28.2421875 | -7.1 |
| 28.25 | -5.8 |
| 28.2578125 | -2.7 |
| 28.265625 | -1.1 |
| 28.2734375 | 0.6 |
| 28.28125 | -0.8 |
| 28.2890625 | -9.5 |
| 28.296875 | -14.4 |
| 28.3046875 | -9.6 |
| 28.3125 | -5.9 |
| 28.3203125 | -7.3 |
| 28.328125 | -9.8 |
| 28.3359375 | -8.7 |
| 28.34375 | -2 |
| 28.3515625 | 0.3 |
| 28.359375 | -6.5 |
| 28.3671875 | -12 |
| 28.375 | -11.8 |
| 28.3828125 | -6.9 |
| 28.390625 | -1.5 |
| 28.3984375 | -2.3 |
| 28.40625 | -2.2 |
| 28.4140625 | 2 |
| 28.421875 | -1.7 |
| 28.4296875 | -8.7 |
| 28.4375 | -9.9 |
| 28.4453125 | -12.2 |
| 28.453125 | -13.5 |
| 28.4609375 | -7.4 |
| 28.46875 | -1.5 |
| 28.4765625 | 0.9 |
| 28.484375 | 5.3 |
| 28.4921875 | 11.7 |
| 28.5 | 15.7 |
| 28.5078125 | 16.2 |
| 28.515625 | 16.8 |
| 28.5234375 | 19.2 |
| 28.53125 | 19.7 |
| 28.5390625 | 15.7 |
| 28.546875 | 9.7 |
| 28.5546875 | 4.8 |
| 28.5625 | 0.9 |
| 28.5703125 | 1.3 |
| 28.578125 | 5 |
| 28.5859375 | 3.4 |
| 28.59375 | -0.3 |
| 28.6015625 | 1.1 |
| 28.609375 | -0.9 |
| 28.6171875 | -5.3 |
| 28.625 | -3.2 |
| 28.6328125 | -4.5 |
| 28.640625 | -12.4 |
| 28.6484375 | -16.2 |
| 28.65625 | -18 |
| 28.6640625 | -18.5 |
| 28.671875 | -14.8 |
| 28.6796875 | -14.1 |
| 28.6875 | -14.7 |
| 28.6953125 | -12 |
| 28.703125 | -13.8 |
| 28.7109375 | -19.4 |
| 28.71875 | -20.6 |
| 28.7265625 | -17.8 |
| 28.734375 | -13.8 |
| 28.7421875 | -16.8 |
| 28.75 | -26.4 |
| 28.7578125 | -27.6 |
| 28.765625 | -25.1 |
| 28.7734375 | -30.5 |
| 28.78125 | -34.2 |
| 28.7890625 | -33.9 |
| 28.796875 | -33.1 |
| 28.8046875 | -27 |
| 28.8125 | -20.5 |
| 28.8203125 | -18.7 |
| 28.828125 | -16.5 |
| 28.8359375 | -15.9 |
| 28.84375 | -16.3 |
| 28.8515625 | -15.2 |
| 28.859375 | -17.1 |
| 28.8671875 | -20.1 |
| 28.875 | -18.9 |
| 28.8828125 | -14 |
| 28.890625 | -8 |
| 28.8984375 | -6.3 |
| 28.90625 | -8.6 |
| 28.9140625 | -6.5 |
| 28.921875 | -0.4 |
| 28.9296875 | 3.6 |
| 28.9375 | 4.2 |
| 28.9453125 | 2.9 |
| 28.953125 | 3.7 |
| 28.9609375 | 8 |
| 28.96875 | 11.1 |
| 28.9765625 | 13.1 |
| 28.984375 | 18.3 |
| 28.9921875 | 22.9 |
| 29.0 | 24.6 |
| 29.0078125 | 29.5 |
| 29.015625 | 35.5 |
| 29.0234375 | 35.9 |
| 29.03125 | 34.9 |
| 29.0390625 | 35.4 |
| 29.046875 | 35.3 |
| 29.0546875 | 39.9 |
| 29.0625 | 49.7 |
| 29.0703125 | 55.1 |
| 29.078125 | 49.9 |
| 29.0859375 | 38.6 |
| 29.09375 | 34.2 |
| 29.1015625 | 38.1 |
| 29.109375 | 37.8 |
| 29.1171875 | 36.3 |
| 29.125 | 39 |
| 29.1328125 | 37 |
| 29.140625 | 33.2 |
| 29.1484375 | 35.3 |
| 29.15625 | 35.8 |
| 29.1640625 | 34 |
| 29.171875 | 37.2 |
| 29.1796875 | 40.2 |
| 29.1875 | 38.8 |
| 29.1953125 | 36.3 |
| 29.203125 | 35 |
| 29.2109375 | 34.3 |
| 29.21875 | 31.4 |
| 29.2265625 | 27 |
| 29.234375 | 26.7 |
| 29.2421875 | 31.5 |
| 29.25 | 33.5 |
| 29.2578125 | 26.4 |
| 29.265625 | 17.9 |
| 29.2734375 | 18 |
| 29.28125 | 22.2 |
| 29.2890625 | 23.4 |
| 29.296875 | 23.7 |
| 29.3046875 | 22.8 |
| 29.3125 | 20.9 |
| 29.3203125 | 23.5 |
| 29.328125 | 27.1 |
| 29.3359375 | 26.8 |
| 29.34375 | 27.5 |
| 29.3515625 | 29 |
| 29.359375 | 25 |
| 29.3671875 | 19.9 |
| 29.375 | 17.4 |
| 29.3828125 | 13.6 |
| 29.390625 | 11 |
| 29.3984375 | 12.1 |
| 29.40625 | 10.5 |
| 29.4140625 | 3.8 |
| 29.421875 | -2.5 |
| 29.4296875 | -5.7 |
| 29.4375 | -5.5 |
| 29.4453125 | -2.8 |
| 29.453125 | -1 |
| 29.4609375 | -1.3 |
| 29.46875 | -1.2 |
| 29.4765625 | -0.6 |
| 29.484375 | -1.9 |
| 29.4921875 | -5.2 |
| 29.5 | -5.7 |
| 29.5078125 | -1.9 |
| 29.515625 | -3.5 |
| 29.5234375 | -15 |
| 29.53125 | -26 |
| 29.5390625 | -29 |
| 29.546875 | -28.2 |
| 29.5546875 | -27.8 |
| 29.5625 | -27.9 |
| 29.5703125 | -28.1 |
| 29.578125 | -26.2 |
| 29.5859375 | -21 |
| 29.59375 | -17.8 |
| 29.6015625 | -20.2 |
| 29.609375 | -23.2 |
| 29.6171875 | -23.4 |
| 29.625 | -21.7 |
| 29.6328125 | -18.3 |
| 29.640625 | -14.3 |
| 29.6484375 | -9.3 |
| 29.65625 | -3.7 |
| 29.6640625 | -2.9 |
| 29.671875 | -3.4 |
| 29.6796875 | 0.6 |
| 29.6875 | 1.6 |
| 29.6953125 | -1.7 |
| 29.703125 | -0.6 |
| 29.7109375 | 0.9 |
| 29.71875 | -2.6 |
| 29.7265625 | -7 |
| 29.734375 | -10.7 |
| 29.7421875 | -10.4 |
| 29.75 | -4.9 |
| 29.7578125 | -2.1 |
| 29.765625 | -5.2 |
| 29.7734375 | -12.5 |
| 29.78125 | -17.7 |
| 29.7890625 | -13.4 |
| 29.796875 | -8.7 |
| 29.8046875 | -11.9 |
| 29.8125 | -15.6 |
| 29.8203125 | -16.3 |
| 29.828125 | -16.2 |
| 29.8359375 | -18.1 |
| 29.84375 | -22.7 |
| 29.8515625 | -22.3 |
| 29.859375 | -20.6 |
| 29.8671875 | -26.3 |
| 29.875 | -30.5 |
| 29.8828125 | -29.8 |
| 29.890625 | -30 |
| 29.8984375 | -28.7 |
| 29.90625 | -27.5 |
| 29.9140625 | -29.7 |
| 29.921875 | -29.3 |
| 29.9296875 | -26.5 |
| 29.9375 | -24.5 |
| 29.9453125 | -24.1 |
| 29.953125 | -25.9 |
| 29.9609375 | -25.1 |
| 29.96875 | -21.4 |
| 29.9765625 | -21.6 |
| 29.984375 | -25.1 |
| 29.9921875 | -27.2 |
| 30.0 | -26.9 |
| 30.0078125 | -23.9 |
| 30.015625 | -20.1 |
| 30.0234375 | -16.8 |
| 30.03125 | -12.2 |
| 30.0390625 | -6.4 |
| 30.046875 | -0.8 |
| 30.0546875 | 1.4 |
| 30.0625 | 0.1 |
| 30.0703125 | 3.4 |
| 30.078125 | 10.7 |
| 30.0859375 | 13.2 |
| 30.09375 | 12.3 |
| 30.1015625 | 12.2 |
| 30.109375 | 13.2 |
| 30.1171875 | 16.8 |
| 30.125 | 19.3 |
| 30.1328125 | 18.3 |
| 30.140625 | 17.2 |
| 30.1484375 | 14.8 |
| 30.15625 | 12.5 |
| 30.1640625 | 12.9 |
| 30.171875 | 11.9 |
| 30.1796875 | 10.7 |
| 30.1875 | 12.6 |
| 30.1953125 | 15.2 |
| 30.203125 | 17.2 |
| 30.2109375 | 16.2 |
| 30.21875 | 13 |
| 30.2265625 | 11.4 |
| 30.234375 | 6.2 |
| 30.2421875 | 1.5 |
| 30.25 | 9.7 |
| 30.2578125 | 21.2 |
| 30.265625 | 24.2 |
| 30.2734375 | 25.4 |
| 30.28125 | 24.6 |
| 30.2890625 | 20.4 |
| 30.296875 | 20.9 |
| 30.3046875 | 22.7 |
| 30.3125 | 17.1 |
| 30.3203125 | 7.8 |
| 30.328125 | -0.4 |
| 30.3359375 | -6.3 |
| 30.34375 | -8.1 |
| 30.3515625 | -7.8 |
| 30.359375 | -8.1 |
| 30.3671875 | -4.4 |
| 30.375 | 3.7 |
| 30.3828125 | 8.1 |
| 30.390625 | 9 |
| 30.3984375 | 11.1 |
| 30.40625 | 11.6 |
| 30.4140625 | 13.2 |
| 30.421875 | 19.6 |
| 30.4296875 | 21.7 |
| 30.4375 | 21.1 |
| 30.4453125 | 30.2 |
| 30.453125 | 41.1 |
| 30.4609375 | 43.4 |
| 30.46875 | 42.9 |
| 30.4765625 | 42.7 |
| 30.484375 | 40.4 |
| 30.4921875 | 38.4 |
| 30.5 | 37.5 |
| 30.5078125 | 34.6 |
| 30.515625 | 27.5 |
| 30.5234375 | 21.3 |
| 30.53125 | 20.4 |
| 30.5390625 | 19 |
| 30.546875 | 11.6 |
| 30.5546875 | 1.3 |
| 30.5625 | -6.7 |
| 30.5703125 | -8.2 |
| 30.578125 | -7.3 |
| 30.5859375 | -10.3 |
| 30.59375 | -13.1 |
| 30.6015625 | -13.3 |
| 30.609375 | -13.2 |
| 30.6171875 | -13.2 |
| 30.625 | -15.5 |
| 30.6328125 | -19.6 |
| 30.640625 | -23.6 |
| 30.6484375 | -28.5 |
| 30.65625 | -30.3 |
| 30.6640625 | -25.7 |
| 30.671875 | -22.3 |
| 30.6796875 | -23.3 |
| 30.6875 | -24.4 |
| 30.6953125 | -21.2 |
| 30.703125 | -16.1 |
| 30.7109375 | -17.4 |
| 30.71875 | -22.5 |
| 30.7265625 | -20.7 |
| 30.734375 | -13.9 |
| 30.7421875 | -9.7 |
| 30.75 | -7.7 |
| 30.7578125 | -7.2 |
| 30.765625 | -8.9 |
| 30.7734375 | -8.4 |
| 30.78125 | -3.1 |
| 30.7890625 | 1 |
| 30.796875 | -0.6 |
| 30.8046875 | -4.3 |
| 30.8125 | -8.7 |
| 30.8203125 | -14 |
| 30.828125 | -14.4 |
| 30.8359375 | -7.4 |
| 30.84375 | -1.9 |
| 30.8515625 | -1.8 |
| 30.859375 | -5.1 |
| 30.8671875 | -12.7 |
| 30.875 | -22.5 |
| 30.8828125 | -28.5 |
| 30.890625 | -31.1 |
| 30.8984375 | -30.9 |
| 30.90625 | -27.3 |
| 30.9140625 | -21.2 |
| 30.921875 | -14.6 |
| 30.9296875 | -12.1 |
| 30.9375 | -10.6 |
| 30.9453125 | -4 |
| 30.953125 | 1.1 |
| 30.9609375 | 3.6 |
| 30.96875 | 9.9 |
| 30.9765625 | 14.1 |
| 30.984375 | 15.6 |
| 30.9921875 | 15.9 |
| 31.0 | 7.9 |
| 31.0078125 | 0.6 |
| 31.015625 | 3.6 |
| 31.0234375 | 5.3 |
| 31.03125 | 5.7 |
| 31.0390625 | 12.1 |
| 31.046875 | 18.2 |
| 31.0546875 | 21 |
| 31.0625 | 20.2 |
| 31.0703125 | 14.8 |
| 31.078125 | 11.6 |
| 31.0859375 | 10.9 |
| 31.09375 | 8.5 |
| 31.1015625 | 8.4 |
| 31.109375 | 11.1 |
| 31.1171875 | 14.2 |
| 31.125 | 17.6 |
| 31.1328125 | 19.4 |
| 31.140625 | 22.1 |
| 31.1484375 | 26.7 |
| 31.15625 | 23.6 |
| 31.1640625 | 15 |
| 31.171875 | 13.2 |
| 31.1796875 | 14.2 |
| 31.1875 | 11.2 |
| 31.1953125 | 8.2 |
| 31.203125 | 6.1 |
| 31.2109375 | 4 |
| 31.21875 | 3.5 |
| 31.2265625 | 1.5 |
| 31.234375 | -4.7 |
| 31.2421875 | -12.6 |
| 31.25 | -19.5 |
| 31.2578125 | -22.9 |
| 31.265625 | -25.9 |
| 31.2734375 | -34.8 |
| 31.28125 | -44 |
| 31.2890625 | -45.1 |
| 31.296875 | -44.5 |
| 31.3046875 | -46.2 |
| 31.3125 | -42.1 |
| 31.3203125 | -33.9 |
| 31.328125 | -29.1 |
| 31.3359375 | -23.9 |
| 31.34375 | -18.7 |
| 31.3515625 | -18 |
| 31.359375 | -13.4 |
| 31.3671875 | -6.6 |
| 31.375 | -9.2 |
| 31.3828125 | -11.1 |
| 31.390625 | -6 |
| 31.3984375 | -6.8 |
| 31.40625 | -10.9 |
| 31.4140625 | -7.3 |
| 31.421875 | -0.6 |
| 31.4296875 | 4.2 |
| 31.4375 | 9.3 |
| 31.4453125 | 15.4 |
| 31.453125 | 19.9 |
| 31.4609375 | 19.5 |
| 31.46875 | 17.4 |
| 31.4765625 | 19 |
| 31.484375 | 20.9 |
| 31.4921875 | 19.3 |
| 31.5 | 17.7 |
| 31.5078125 | 16 |
| 31.515625 | 10.2 |
| 31.5234375 | 7 |
| 31.53125 | 14.8 |
| 31.5390625 | 22.9 |
| 31.546875 | 19 |
| 31.5546875 | 11 |
| 31.5625 | 7.4 |
| 31.5703125 | 5.3 |
| 31.578125 | 3 |
| 31.5859375 | 1.5 |
| 31.59375 | 0.1 |
| 31.6015625 | 0.2 |
| 31.609375 | 0.3 |
| 31.6171875 | -3.8 |
| 31.625 | -6.4 |
| 31.6328125 | -3 |
| 31.640625 | -1.4 |
| 31.6484375 | -1.1 |
| 31.65625 | 5 |
| 31.6640625 | 10 |
| 31.671875 | 8.7 |
| 31.6796875 | 8.2 |
| 31.6875 | 9.1 |
| 31.6953125 | 6.1 |
| 31.703125 | 0.7 |
| 31.7109375 | -1.1 |
| 31.71875 | 0.5 |
| 31.7265625 | 1.5 |
| 31.734375 | 5.1 |
| 31.7421875 | 11.7 |
| 31.75 | 11.9 |
| 31.7578125 | 7.5 |
| 31.765625 | 6.7 |
| 31.7734375 | 4.7 |
| 31.78125 | -1.6 |
| 31.7890625 | -6.7 |
| 31.796875 | -8.3 |
| 31.8046875 | -6.6 |
| 31.8125 | -3.5 |
| 31.8203125 | -1.1 |
| 31.828125 | 0.3 |
| 31.8359375 | -1.5 |
| 31.84375 | -2.9 |
| 31.8515625 | 0.5 |
| 31.859375 | 0.9 |
| 31.8671875 | -3.2 |
| 31.875 | -4.4 |
| 31.8828125 | -5.7 |
| 31.890625 | -8.1 |
| 31.8984375 | -6.5 |
| 31.90625 | -5.5 |
| 31.9140625 | -8.7 |
| 31.921875 | -11 |
| 31.9296875 | -10.1 |
| 31.9375 | -8.7 |
| 31.9453125 | -10.2 |
| 31.953125 | -12.1 |
| 31.9609375 | -7.7 |
| 31.96875 | -0.7 |
| 31.9765625 | 2.2 |
| 31.984375 | 4.7 |
| 31.9921875 | 6.9 |